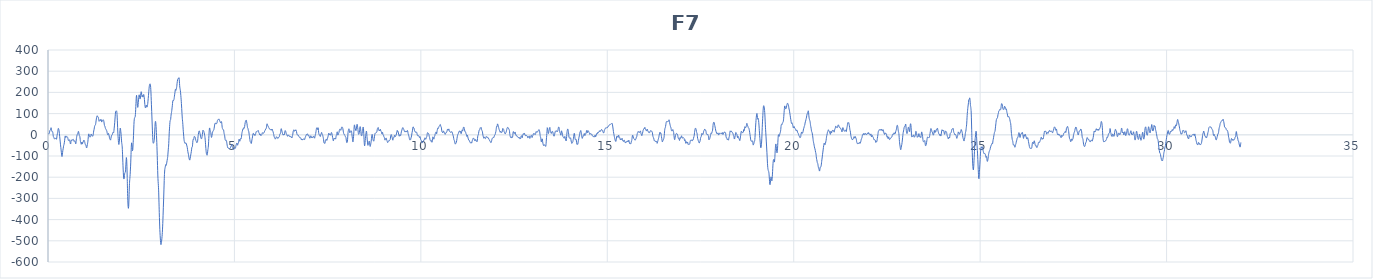
| Category | F7 |
|---|---|
| 0.0 | 8.9 |
| 0.0078125 | 4.5 |
| 0.015625 | 3.4 |
| 0.0234375 | 4.8 |
| 0.03125 | 5.8 |
| 0.0390625 | 10 |
| 0.046875 | 17.3 |
| 0.0546875 | 22 |
| 0.0625 | 23.2 |
| 0.0703125 | 26.2 |
| 0.078125 | 32.6 |
| 0.0859375 | 32.5 |
| 0.09375 | 23.6 |
| 0.1015625 | 16.7 |
| 0.109375 | 14.8 |
| 0.1171875 | 15 |
| 0.125 | 14.3 |
| 0.1328125 | 6.5 |
| 0.140625 | -5.1 |
| 0.1484375 | -10.2 |
| 0.15625 | -11.9 |
| 0.1640625 | -16.3 |
| 0.171875 | -19.3 |
| 0.1796875 | -18.6 |
| 0.1875 | -17.9 |
| 0.1953125 | -17.7 |
| 0.203125 | -16.3 |
| 0.2109375 | -15.2 |
| 0.21875 | -18.2 |
| 0.2265625 | -21.1 |
| 0.234375 | -15.4 |
| 0.2421875 | -4.1 |
| 0.25 | 3.7 |
| 0.2578125 | 10.3 |
| 0.265625 | 20.6 |
| 0.2734375 | 29.1 |
| 0.28125 | 30 |
| 0.2890625 | 25.9 |
| 0.296875 | 18.6 |
| 0.3046875 | 6.9 |
| 0.3125 | -6.8 |
| 0.3203125 | -19.9 |
| 0.328125 | -33.7 |
| 0.3359375 | -47.4 |
| 0.34375 | -59.1 |
| 0.3515625 | -71.2 |
| 0.359375 | -84.5 |
| 0.3671875 | -96.1 |
| 0.375 | -102.6 |
| 0.3828125 | -97.8 |
| 0.390625 | -84 |
| 0.3984375 | -73.3 |
| 0.40625 | -66 |
| 0.4140625 | -56.6 |
| 0.421875 | -50.1 |
| 0.4296875 | -45.3 |
| 0.4375 | -37.5 |
| 0.4453125 | -28.2 |
| 0.453125 | -15.8 |
| 0.4609375 | -5.7 |
| 0.46875 | -7.7 |
| 0.4765625 | -12.8 |
| 0.484375 | -11.9 |
| 0.4921875 | -9.1 |
| 0.5 | -7.3 |
| 0.5078125 | -8 |
| 0.515625 | -10.1 |
| 0.5234375 | -10.9 |
| 0.53125 | -14.6 |
| 0.5390625 | -22.3 |
| 0.546875 | -27.1 |
| 0.5546875 | -26 |
| 0.5625 | -23.3 |
| 0.5703125 | -23.4 |
| 0.578125 | -25.6 |
| 0.5859375 | -29.1 |
| 0.59375 | -35.8 |
| 0.6015625 | -43 |
| 0.609375 | -41.6 |
| 0.6171875 | -31 |
| 0.625 | -23.9 |
| 0.6328125 | -26.1 |
| 0.640625 | -27.3 |
| 0.6484375 | -24.3 |
| 0.65625 | -22.9 |
| 0.6640625 | -22.6 |
| 0.671875 | -21.4 |
| 0.6796875 | -21.6 |
| 0.6875 | -25.5 |
| 0.6953125 | -30.5 |
| 0.703125 | -30.8 |
| 0.7109375 | -28.4 |
| 0.71875 | -28.8 |
| 0.7265625 | -31 |
| 0.734375 | -36.5 |
| 0.7421875 | -42.8 |
| 0.75 | -38.4 |
| 0.7578125 | -24.7 |
| 0.765625 | -13.1 |
| 0.7734375 | -5.5 |
| 0.78125 | 0 |
| 0.7890625 | 2.4 |
| 0.796875 | 4.1 |
| 0.8046875 | 9.3 |
| 0.8125 | 15.5 |
| 0.8203125 | 15.4 |
| 0.828125 | 8 |
| 0.8359375 | -0.6 |
| 0.84375 | -5.3 |
| 0.8515625 | -7.3 |
| 0.859375 | -15 |
| 0.8671875 | -27.7 |
| 0.875 | -34.6 |
| 0.8828125 | -38.4 |
| 0.890625 | -44.6 |
| 0.8984375 | -42.2 |
| 0.90625 | -34.2 |
| 0.9140625 | -37.5 |
| 0.921875 | -43.7 |
| 0.9296875 | -38.3 |
| 0.9375 | -33.3 |
| 0.9453125 | -34.4 |
| 0.953125 | -30.3 |
| 0.9609375 | -24.8 |
| 0.96875 | -27 |
| 0.9765625 | -30 |
| 0.984375 | -33.1 |
| 0.9921875 | -40.7 |
| 1.0 | -46 |
| 1.0078125 | -46.6 |
| 1.015625 | -49.3 |
| 1.0234375 | -54.8 |
| 1.03125 | -60.5 |
| 1.0390625 | -61.7 |
| 1.046875 | -55.2 |
| 1.0546875 | -46.7 |
| 1.0625 | -39.7 |
| 1.0703125 | -30 |
| 1.078125 | -15.1 |
| 1.0859375 | -0.8 |
| 1.09375 | 4.4 |
| 1.1015625 | 1.3 |
| 1.109375 | -4.2 |
| 1.1171875 | -9.5 |
| 1.125 | -11.1 |
| 1.1328125 | -10.1 |
| 1.140625 | -9.7 |
| 1.1484375 | -4.2 |
| 1.15625 | 3.5 |
| 1.1640625 | 2.2 |
| 1.171875 | -2.1 |
| 1.1796875 | -2.2 |
| 1.1875 | -4 |
| 1.1953125 | -6.9 |
| 1.203125 | -6 |
| 1.2109375 | -0.4 |
| 1.21875 | 9.4 |
| 1.2265625 | 18.2 |
| 1.234375 | 24.1 |
| 1.2421875 | 32.2 |
| 1.25 | 40 |
| 1.2578125 | 43.5 |
| 1.265625 | 45.3 |
| 1.2734375 | 47.7 |
| 1.28125 | 54.4 |
| 1.2890625 | 65.4 |
| 1.296875 | 74.8 |
| 1.3046875 | 82.4 |
| 1.3125 | 88.5 |
| 1.3203125 | 89.6 |
| 1.328125 | 87 |
| 1.3359375 | 84.6 |
| 1.34375 | 84.4 |
| 1.3515625 | 81.6 |
| 1.359375 | 71.5 |
| 1.3671875 | 64.3 |
| 1.375 | 65.2 |
| 1.3828125 | 64.9 |
| 1.390625 | 66.8 |
| 1.3984375 | 71.9 |
| 1.40625 | 69.6 |
| 1.4140625 | 67.6 |
| 1.421875 | 72.2 |
| 1.4296875 | 69.6 |
| 1.4375 | 61.3 |
| 1.4453125 | 60.8 |
| 1.453125 | 65.7 |
| 1.4609375 | 68.6 |
| 1.46875 | 69.9 |
| 1.4765625 | 70.8 |
| 1.484375 | 70.7 |
| 1.4921875 | 67.9 |
| 1.5 | 61.1 |
| 1.5078125 | 50.9 |
| 1.515625 | 43.6 |
| 1.5234375 | 41.7 |
| 1.53125 | 37.2 |
| 1.5390625 | 30.4 |
| 1.546875 | 29.2 |
| 1.5546875 | 26.9 |
| 1.5625 | 21.4 |
| 1.5703125 | 20.9 |
| 1.578125 | 18 |
| 1.5859375 | 9.4 |
| 1.59375 | 4.5 |
| 1.6015625 | 0.9 |
| 1.609375 | 0.6 |
| 1.6171875 | 6.4 |
| 1.625 | 5.9 |
| 1.6328125 | -0.3 |
| 1.640625 | -5.6 |
| 1.6484375 | -14 |
| 1.65625 | -19.2 |
| 1.6640625 | -19.3 |
| 1.671875 | -23.7 |
| 1.6796875 | -24.7 |
| 1.6875 | -16.8 |
| 1.6953125 | -9.6 |
| 1.703125 | -4.9 |
| 1.7109375 | -1.3 |
| 1.71875 | -0.7 |
| 1.7265625 | 1.5 |
| 1.734375 | 7.2 |
| 1.7421875 | 11.3 |
| 1.75 | 10.3 |
| 1.7578125 | 9 |
| 1.765625 | 15.2 |
| 1.7734375 | 27.9 |
| 1.78125 | 42 |
| 1.7890625 | 57 |
| 1.796875 | 74.4 |
| 1.8046875 | 94.2 |
| 1.8125 | 108.6 |
| 1.8203125 | 111.4 |
| 1.828125 | 111.2 |
| 1.8359375 | 113.2 |
| 1.84375 | 109.7 |
| 1.8515625 | 95.6 |
| 1.859375 | 68.7 |
| 1.8671875 | 33.3 |
| 1.875 | 4.1 |
| 1.8828125 | -17.2 |
| 1.890625 | -36.2 |
| 1.8984375 | -45.5 |
| 1.90625 | -42.2 |
| 1.9140625 | -30.2 |
| 1.921875 | -7.1 |
| 1.9296875 | 19 |
| 1.9375 | 31.1 |
| 1.9453125 | 26.1 |
| 1.953125 | 14.7 |
| 1.9609375 | 0.7 |
| 1.96875 | -19.3 |
| 1.9765625 | -37.1 |
| 1.984375 | -46.3 |
| 1.9921875 | -62.6 |
| 2.0 | -94.5 |
| 2.0078125 | -129.5 |
| 2.015625 | -161.6 |
| 2.0234375 | -189.7 |
| 2.03125 | -205.9 |
| 2.0390625 | -208 |
| 2.046875 | -199 |
| 2.0546875 | -185.6 |
| 2.0625 | -178.5 |
| 2.0703125 | -177.5 |
| 2.078125 | -170.5 |
| 2.0859375 | -151.7 |
| 2.09375 | -125.5 |
| 2.1015625 | -107.3 |
| 2.109375 | -115.5 |
| 2.1171875 | -150.2 |
| 2.125 | -201.7 |
| 2.1328125 | -261.9 |
| 2.140625 | -311.4 |
| 2.1484375 | -337.4 |
| 2.15625 | -346.9 |
| 2.1640625 | -337.6 |
| 2.171875 | -302.1 |
| 2.1796875 | -256 |
| 2.1875 | -223.4 |
| 2.1953125 | -206 |
| 2.203125 | -187.1 |
| 2.2109375 | -161.4 |
| 2.21875 | -132.6 |
| 2.2265625 | -93.5 |
| 2.234375 | -53.4 |
| 2.2421875 | -37.8 |
| 2.25 | -45.3 |
| 2.2578125 | -61.3 |
| 2.265625 | -75.3 |
| 2.2734375 | -70.3 |
| 2.28125 | -47.5 |
| 2.2890625 | -20.6 |
| 2.296875 | 13.3 |
| 2.3046875 | 48.7 |
| 2.3125 | 70.4 |
| 2.3203125 | 79.4 |
| 2.328125 | 81.6 |
| 2.3359375 | 83.4 |
| 2.34375 | 95.3 |
| 2.3515625 | 118.5 |
| 2.359375 | 148.3 |
| 2.3671875 | 176.6 |
| 2.375 | 186.1 |
| 2.3828125 | 173.8 |
| 2.390625 | 155.2 |
| 2.3984375 | 138.9 |
| 2.40625 | 129.3 |
| 2.4140625 | 135.4 |
| 2.421875 | 151.9 |
| 2.4296875 | 168.2 |
| 2.4375 | 182.7 |
| 2.4453125 | 188.7 |
| 2.453125 | 183.4 |
| 2.4609375 | 175.1 |
| 2.46875 | 168.9 |
| 2.4765625 | 171.8 |
| 2.484375 | 186.5 |
| 2.4921875 | 199.3 |
| 2.5 | 203.3 |
| 2.5078125 | 198.5 |
| 2.515625 | 185.5 |
| 2.5234375 | 179.6 |
| 2.53125 | 185.3 |
| 2.5390625 | 184.6 |
| 2.546875 | 177.9 |
| 2.5546875 | 181 |
| 2.5625 | 189.4 |
| 2.5703125 | 189.3 |
| 2.578125 | 180.6 |
| 2.5859375 | 166.9 |
| 2.59375 | 150.1 |
| 2.6015625 | 136.3 |
| 2.609375 | 129 |
| 2.6171875 | 126.6 |
| 2.625 | 131.1 |
| 2.6328125 | 139.1 |
| 2.640625 | 139.7 |
| 2.6484375 | 133.6 |
| 2.65625 | 130.6 |
| 2.6640625 | 133.6 |
| 2.671875 | 142.4 |
| 2.6796875 | 155.8 |
| 2.6875 | 170.6 |
| 2.6953125 | 185.9 |
| 2.703125 | 203 |
| 2.7109375 | 219.8 |
| 2.71875 | 231.5 |
| 2.7265625 | 237.8 |
| 2.734375 | 240.5 |
| 2.7421875 | 238.4 |
| 2.75 | 230.6 |
| 2.7578125 | 212.3 |
| 2.765625 | 180.3 |
| 2.7734375 | 144.3 |
| 2.78125 | 110.6 |
| 2.7890625 | 74.5 |
| 2.796875 | 36.9 |
| 2.8046875 | 1.6 |
| 2.8125 | -26 |
| 2.8203125 | -38.7 |
| 2.828125 | -39.5 |
| 2.8359375 | -36.9 |
| 2.84375 | -31.8 |
| 2.8515625 | -20.3 |
| 2.859375 | 2.5 |
| 2.8671875 | 33.1 |
| 2.875 | 56.2 |
| 2.8828125 | 63.6 |
| 2.890625 | 57.7 |
| 2.8984375 | 39.4 |
| 2.90625 | 11.5 |
| 2.9140625 | -20 |
| 2.921875 | -55.2 |
| 2.9296875 | -97.9 |
| 2.9375 | -145.7 |
| 2.9453125 | -189.5 |
| 2.953125 | -219.6 |
| 2.9609375 | -239.8 |
| 2.96875 | -270.4 |
| 2.9765625 | -317.7 |
| 2.984375 | -367.1 |
| 2.9921875 | -411.1 |
| 3.0 | -447.5 |
| 3.0078125 | -474.8 |
| 3.015625 | -497.8 |
| 3.0234375 | -514.3 |
| 3.03125 | -518.1 |
| 3.0390625 | -512.4 |
| 3.046875 | -501.6 |
| 3.0546875 | -487.8 |
| 3.0625 | -471.3 |
| 3.0703125 | -448.6 |
| 3.078125 | -418.6 |
| 3.0859375 | -381.9 |
| 3.09375 | -341.7 |
| 3.1015625 | -302.3 |
| 3.109375 | -260 |
| 3.1171875 | -215.3 |
| 3.125 | -180.7 |
| 3.1328125 | -162.8 |
| 3.140625 | -155.4 |
| 3.1484375 | -147.8 |
| 3.15625 | -140.9 |
| 3.1640625 | -142.5 |
| 3.171875 | -144 |
| 3.1796875 | -137.1 |
| 3.1875 | -128.7 |
| 3.1953125 | -120.6 |
| 3.203125 | -112.4 |
| 3.2109375 | -103 |
| 3.21875 | -85.8 |
| 3.2265625 | -67.7 |
| 3.234375 | -53.2 |
| 3.2421875 | -27.8 |
| 3.25 | 4.2 |
| 3.2578125 | 27.8 |
| 3.265625 | 48.4 |
| 3.2734375 | 64.8 |
| 3.28125 | 68.3 |
| 3.2890625 | 72.2 |
| 3.296875 | 86.4 |
| 3.3046875 | 98.4 |
| 3.3125 | 105.1 |
| 3.3203125 | 115.5 |
| 3.328125 | 127.1 |
| 3.3359375 | 139.5 |
| 3.34375 | 154.7 |
| 3.3515625 | 161.7 |
| 3.359375 | 160 |
| 3.3671875 | 161.8 |
| 3.375 | 165.3 |
| 3.3828125 | 170.9 |
| 3.390625 | 182.2 |
| 3.3984375 | 191.5 |
| 3.40625 | 201.1 |
| 3.4140625 | 212.8 |
| 3.421875 | 213.8 |
| 3.4296875 | 209.5 |
| 3.4375 | 213.2 |
| 3.4453125 | 219.6 |
| 3.453125 | 228 |
| 3.4609375 | 240.8 |
| 3.46875 | 252 |
| 3.4765625 | 259.9 |
| 3.484375 | 264.8 |
| 3.4921875 | 265.1 |
| 3.5 | 265.2 |
| 3.5078125 | 268.7 |
| 3.515625 | 268 |
| 3.5234375 | 253.3 |
| 3.53125 | 231.8 |
| 3.5390625 | 219.9 |
| 3.546875 | 213.4 |
| 3.5546875 | 200.7 |
| 3.5625 | 184.8 |
| 3.5703125 | 168 |
| 3.578125 | 147.2 |
| 3.5859375 | 124.2 |
| 3.59375 | 100 |
| 3.6015625 | 78.3 |
| 3.609375 | 64 |
| 3.6171875 | 48.1 |
| 3.625 | 26.3 |
| 3.6328125 | 8.4 |
| 3.640625 | -7 |
| 3.6484375 | -23 |
| 3.65625 | -31.1 |
| 3.6640625 | -34.1 |
| 3.671875 | -39.1 |
| 3.6796875 | -41.3 |
| 3.6875 | -39.6 |
| 3.6953125 | -38.3 |
| 3.703125 | -38.3 |
| 3.7109375 | -42.2 |
| 3.71875 | -48.4 |
| 3.7265625 | -53.1 |
| 3.734375 | -59.4 |
| 3.7421875 | -68.6 |
| 3.75 | -78.2 |
| 3.7578125 | -86 |
| 3.765625 | -91.7 |
| 3.7734375 | -99.3 |
| 3.78125 | -108.7 |
| 3.7890625 | -115 |
| 3.796875 | -118.7 |
| 3.8046875 | -118.9 |
| 3.8125 | -112.5 |
| 3.8203125 | -103.5 |
| 3.828125 | -95.1 |
| 3.8359375 | -87.3 |
| 3.84375 | -79.2 |
| 3.8515625 | -67.8 |
| 3.859375 | -58.7 |
| 3.8671875 | -57.7 |
| 3.875 | -52.4 |
| 3.8828125 | -34.9 |
| 3.890625 | -22.8 |
| 3.8984375 | -23.6 |
| 3.90625 | -22.1 |
| 3.9140625 | -13.8 |
| 3.921875 | -8.1 |
| 3.9296875 | -7.5 |
| 3.9375 | -9.2 |
| 3.9453125 | -11.4 |
| 3.953125 | -16.3 |
| 3.9609375 | -24.1 |
| 3.96875 | -28.3 |
| 3.9765625 | -30.6 |
| 3.984375 | -35.7 |
| 3.9921875 | -37.2 |
| 4.0 | -35.6 |
| 4.0078125 | -34.5 |
| 4.015625 | -25 |
| 4.0234375 | -9.8 |
| 4.03125 | 1.1 |
| 4.0390625 | 9.6 |
| 4.046875 | 16.2 |
| 4.0546875 | 18.6 |
| 4.0625 | 16.8 |
| 4.0703125 | 10.8 |
| 4.078125 | 4.9 |
| 4.0859375 | -1.1 |
| 4.09375 | -9.7 |
| 4.1015625 | -15.6 |
| 4.109375 | -17.9 |
| 4.1171875 | -19.1 |
| 4.125 | -15.2 |
| 4.1328125 | -7.4 |
| 4.140625 | 2.7 |
| 4.1484375 | 15 |
| 4.15625 | 21.7 |
| 4.1640625 | 20.2 |
| 4.171875 | 18 |
| 4.1796875 | 15.7 |
| 4.1875 | 10.4 |
| 4.1953125 | 3.4 |
| 4.203125 | -3.8 |
| 4.2109375 | -13.4 |
| 4.21875 | -28.3 |
| 4.2265625 | -46.8 |
| 4.234375 | -64.6 |
| 4.2421875 | -79.9 |
| 4.25 | -89.8 |
| 4.2578125 | -94 |
| 4.265625 | -96.4 |
| 4.2734375 | -92.8 |
| 4.28125 | -80.4 |
| 4.2890625 | -69.4 |
| 4.296875 | -60.5 |
| 4.3046875 | -43.2 |
| 4.3125 | -17.5 |
| 4.3203125 | 8.5 |
| 4.328125 | 27.2 |
| 4.3359375 | 32.4 |
| 4.34375 | 25.6 |
| 4.3515625 | 17.8 |
| 4.359375 | 15.1 |
| 4.3671875 | 9.6 |
| 4.375 | -3.1 |
| 4.3828125 | -12.1 |
| 4.390625 | -10.4 |
| 4.3984375 | -3 |
| 4.40625 | 5.3 |
| 4.4140625 | 11.7 |
| 4.421875 | 16.4 |
| 4.4296875 | 19.7 |
| 4.4375 | 20.7 |
| 4.4453125 | 22.4 |
| 4.453125 | 28.3 |
| 4.4609375 | 37 |
| 4.46875 | 45.8 |
| 4.4765625 | 52 |
| 4.484375 | 55.3 |
| 4.4921875 | 55.8 |
| 4.5 | 52.7 |
| 4.5078125 | 50.9 |
| 4.515625 | 52.8 |
| 4.5234375 | 53.2 |
| 4.53125 | 55.2 |
| 4.5390625 | 62.8 |
| 4.546875 | 68.3 |
| 4.5546875 | 69.7 |
| 4.5625 | 72.5 |
| 4.5703125 | 73.8 |
| 4.578125 | 71.9 |
| 4.5859375 | 72.2 |
| 4.59375 | 72.8 |
| 4.6015625 | 68.3 |
| 4.609375 | 63.4 |
| 4.6171875 | 60.9 |
| 4.625 | 57.7 |
| 4.6328125 | 56.7 |
| 4.640625 | 60.2 |
| 4.6484375 | 62.8 |
| 4.65625 | 59.7 |
| 4.6640625 | 48.7 |
| 4.671875 | 34.9 |
| 4.6796875 | 29.2 |
| 4.6875 | 28 |
| 4.6953125 | 23.9 |
| 4.703125 | 23.2 |
| 4.7109375 | 21.8 |
| 4.71875 | 11.1 |
| 4.7265625 | 2.9 |
| 4.734375 | -0.2 |
| 4.7421875 | -10.1 |
| 4.75 | -21.4 |
| 4.7578125 | -25.9 |
| 4.765625 | -26.9 |
| 4.7734375 | -26.1 |
| 4.78125 | -25.6 |
| 4.7890625 | -30.4 |
| 4.796875 | -39.6 |
| 4.8046875 | -48.7 |
| 4.8125 | -55.6 |
| 4.8203125 | -60.6 |
| 4.828125 | -62.4 |
| 4.8359375 | -61.6 |
| 4.84375 | -63.2 |
| 4.8515625 | -66.2 |
| 4.859375 | -67.1 |
| 4.8671875 | -66.3 |
| 4.875 | -64.5 |
| 4.8828125 | -63.8 |
| 4.890625 | -63.1 |
| 4.8984375 | -57.8 |
| 4.90625 | -53.8 |
| 4.9140625 | -53.3 |
| 4.921875 | -47.8 |
| 4.9296875 | -45 |
| 4.9375 | -52.1 |
| 4.9453125 | -57.8 |
| 4.953125 | -59.9 |
| 4.9609375 | -64.2 |
| 4.96875 | -67.3 |
| 4.9765625 | -68.4 |
| 4.984375 | -69 |
| 4.9921875 | -66.1 |
| 5.0 | -61.9 |
| 5.0078125 | -60.4 |
| 5.015625 | -61.9 |
| 5.0234375 | -63.8 |
| 5.03125 | -60.5 |
| 5.0390625 | -52.5 |
| 5.046875 | -46.7 |
| 5.0546875 | -42.9 |
| 5.0625 | -39.1 |
| 5.0703125 | -40.1 |
| 5.078125 | -46.7 |
| 5.0859375 | -49.1 |
| 5.09375 | -42.9 |
| 5.1015625 | -38.6 |
| 5.109375 | -37.8 |
| 5.1171875 | -29.8 |
| 5.125 | -20.7 |
| 5.1328125 | -23.2 |
| 5.140625 | -29.6 |
| 5.1484375 | -29.3 |
| 5.15625 | -23.4 |
| 5.1640625 | -18.2 |
| 5.171875 | -18.7 |
| 5.1796875 | -19.3 |
| 5.1875 | -12.3 |
| 5.1953125 | 0.2 |
| 5.203125 | 10.1 |
| 5.2109375 | 15.5 |
| 5.21875 | 22.1 |
| 5.2265625 | 27.9 |
| 5.234375 | 26.5 |
| 5.2421875 | 27.3 |
| 5.25 | 33.3 |
| 5.2578125 | 32.6 |
| 5.265625 | 31.4 |
| 5.2734375 | 38.8 |
| 5.28125 | 48.7 |
| 5.2890625 | 57.7 |
| 5.296875 | 63.6 |
| 5.3046875 | 66.2 |
| 5.3125 | 69.5 |
| 5.3203125 | 67.8 |
| 5.328125 | 60.2 |
| 5.3359375 | 53.2 |
| 5.34375 | 43 |
| 5.3515625 | 34 |
| 5.359375 | 32.1 |
| 5.3671875 | 26.6 |
| 5.375 | 19.3 |
| 5.3828125 | 16.7 |
| 5.390625 | 8.5 |
| 5.3984375 | -3.1 |
| 5.40625 | -11 |
| 5.4140625 | -22 |
| 5.421875 | -32 |
| 5.4296875 | -33.5 |
| 5.4375 | -34.8 |
| 5.4453125 | -39.7 |
| 5.453125 | -40.9 |
| 5.4609375 | -34 |
| 5.46875 | -24.2 |
| 5.4765625 | -17.8 |
| 5.484375 | -9.9 |
| 5.4921875 | 0.1 |
| 5.5 | 5.5 |
| 5.5078125 | 7.3 |
| 5.515625 | 4.7 |
| 5.5234375 | -1.3 |
| 5.53125 | -0.9 |
| 5.5390625 | 0.9 |
| 5.546875 | -3.1 |
| 5.5546875 | -3.1 |
| 5.5625 | 1.7 |
| 5.5703125 | 6.1 |
| 5.578125 | 11.7 |
| 5.5859375 | 15.3 |
| 5.59375 | 15.1 |
| 5.6015625 | 15.2 |
| 5.609375 | 16.4 |
| 5.6171875 | 17.4 |
| 5.625 | 17.6 |
| 5.6328125 | 19.1 |
| 5.640625 | 19.9 |
| 5.6484375 | 14.7 |
| 5.65625 | 9.2 |
| 5.6640625 | 7.4 |
| 5.671875 | 2.6 |
| 5.6796875 | -0.8 |
| 5.6875 | 2.9 |
| 5.6953125 | 3.8 |
| 5.703125 | -1.7 |
| 5.7109375 | -4.3 |
| 5.71875 | -1.8 |
| 5.7265625 | -0.3 |
| 5.734375 | 1.1 |
| 5.7421875 | 6.5 |
| 5.75 | 10.2 |
| 5.7578125 | 7.9 |
| 5.765625 | 6.2 |
| 5.7734375 | 7.4 |
| 5.78125 | 8.6 |
| 5.7890625 | 9.2 |
| 5.796875 | 10.2 |
| 5.8046875 | 14.3 |
| 5.8125 | 18.7 |
| 5.8203125 | 19.7 |
| 5.828125 | 22.1 |
| 5.8359375 | 26.8 |
| 5.84375 | 28.7 |
| 5.8515625 | 29.6 |
| 5.859375 | 35.3 |
| 5.8671875 | 45.7 |
| 5.875 | 51.9 |
| 5.8828125 | 48.6 |
| 5.890625 | 44.4 |
| 5.8984375 | 43.4 |
| 5.90625 | 39.6 |
| 5.9140625 | 35.7 |
| 5.921875 | 34.5 |
| 5.9296875 | 31.4 |
| 5.9375 | 27.9 |
| 5.9453125 | 26.7 |
| 5.953125 | 25.9 |
| 5.9609375 | 24.9 |
| 5.96875 | 23.4 |
| 5.9765625 | 24.4 |
| 5.984375 | 27.4 |
| 5.9921875 | 24.8 |
| 6.0 | 21.4 |
| 6.0078125 | 25.4 |
| 6.015625 | 26.3 |
| 6.0234375 | 20.4 |
| 6.03125 | 16.8 |
| 6.0390625 | 12.8 |
| 6.046875 | 6.4 |
| 6.0546875 | 1.1 |
| 6.0625 | -6.3 |
| 6.0703125 | -12.4 |
| 6.078125 | -13.1 |
| 6.0859375 | -16.1 |
| 6.09375 | -20.3 |
| 6.1015625 | -19.5 |
| 6.109375 | -17 |
| 6.1171875 | -13.2 |
| 6.125 | -9.1 |
| 6.1328125 | -10.5 |
| 6.140625 | -12.8 |
| 6.1484375 | -12.4 |
| 6.15625 | -14.7 |
| 6.1640625 | -17.5 |
| 6.171875 | -15.7 |
| 6.1796875 | -13 |
| 6.1875 | -12.5 |
| 6.1953125 | -11.8 |
| 6.203125 | -9.1 |
| 6.2109375 | -2.8 |
| 6.21875 | 4.1 |
| 6.2265625 | 5.5 |
| 6.234375 | 6.4 |
| 6.2421875 | 16 |
| 6.25 | 26.9 |
| 6.2578125 | 28.7 |
| 6.265625 | 23.5 |
| 6.2734375 | 17.3 |
| 6.28125 | 12 |
| 6.2890625 | 6.6 |
| 6.296875 | 1.1 |
| 6.3046875 | -1.7 |
| 6.3125 | -1 |
| 6.3203125 | 1.6 |
| 6.328125 | 1.9 |
| 6.3359375 | -0.9 |
| 6.34375 | 2.6 |
| 6.3515625 | 13.4 |
| 6.359375 | 19.6 |
| 6.3671875 | 19.1 |
| 6.375 | 16.3 |
| 6.3828125 | 11.2 |
| 6.390625 | 6.2 |
| 6.3984375 | 3.3 |
| 6.40625 | 0.2 |
| 6.4140625 | -3.6 |
| 6.421875 | -6.8 |
| 6.4296875 | -6.5 |
| 6.4375 | -3 |
| 6.4453125 | -0.8 |
| 6.453125 | -1 |
| 6.4609375 | -3.2 |
| 6.46875 | -7.1 |
| 6.4765625 | -7.4 |
| 6.484375 | -6.6 |
| 6.4921875 | -9.6 |
| 6.5 | -9.8 |
| 6.5078125 | -8.1 |
| 6.515625 | -10.5 |
| 6.5234375 | -10.8 |
| 6.53125 | -11.2 |
| 6.5390625 | -15.1 |
| 6.546875 | -12 |
| 6.5546875 | -5.3 |
| 6.5625 | -1.3 |
| 6.5703125 | 8.7 |
| 6.578125 | 18.2 |
| 6.5859375 | 20.3 |
| 6.59375 | 23.4 |
| 6.6015625 | 22.4 |
| 6.609375 | 16.8 |
| 6.6171875 | 18.3 |
| 6.625 | 20.1 |
| 6.6328125 | 18.4 |
| 6.640625 | 21.8 |
| 6.6484375 | 23.9 |
| 6.65625 | 20.6 |
| 6.6640625 | 16 |
| 6.671875 | 8.1 |
| 6.6796875 | 1.7 |
| 6.6875 | 0.6 |
| 6.6953125 | -1.3 |
| 6.703125 | -2 |
| 6.7109375 | -0.9 |
| 6.71875 | -4.1 |
| 6.7265625 | -7.3 |
| 6.734375 | -8.4 |
| 6.7421875 | -11.7 |
| 6.75 | -13 |
| 6.7578125 | -11.8 |
| 6.765625 | -12.9 |
| 6.7734375 | -13.9 |
| 6.78125 | -16 |
| 6.7890625 | -21.6 |
| 6.796875 | -23.2 |
| 6.8046875 | -20 |
| 6.8125 | -20.7 |
| 6.8203125 | -24.4 |
| 6.828125 | -24.4 |
| 6.8359375 | -21.1 |
| 6.84375 | -19.7 |
| 6.8515625 | -20.6 |
| 6.859375 | -19.7 |
| 6.8671875 | -18.8 |
| 6.875 | -21.8 |
| 6.8828125 | -22.7 |
| 6.890625 | -18.1 |
| 6.8984375 | -13 |
| 6.90625 | -9.4 |
| 6.9140625 | -6.1 |
| 6.921875 | -2.2 |
| 6.9296875 | 1.2 |
| 6.9375 | 0.6 |
| 6.9453125 | 0 |
| 6.953125 | 3.5 |
| 6.9609375 | 4.6 |
| 6.96875 | 0.7 |
| 6.9765625 | -3.7 |
| 6.984375 | -5.5 |
| 6.9921875 | -3.6 |
| 7.0 | -3.6 |
| 7.0078125 | -9 |
| 7.015625 | -13.9 |
| 7.0234375 | -15.8 |
| 7.03125 | -14.9 |
| 7.0390625 | -9.9 |
| 7.046875 | -4.9 |
| 7.0546875 | -5.5 |
| 7.0625 | -11.5 |
| 7.0703125 | -14 |
| 7.078125 | -9.8 |
| 7.0859375 | -9.8 |
| 7.09375 | -13.2 |
| 7.1015625 | -11.7 |
| 7.109375 | -10.6 |
| 7.1171875 | -10.8 |
| 7.125 | -7.6 |
| 7.1328125 | -7.6 |
| 7.140625 | -13.1 |
| 7.1484375 | -16.1 |
| 7.15625 | -12.5 |
| 7.1640625 | -4.9 |
| 7.171875 | 1.2 |
| 7.1796875 | 6.2 |
| 7.1875 | 14.7 |
| 7.1953125 | 25 |
| 7.203125 | 31.5 |
| 7.2109375 | 33.1 |
| 7.21875 | 30.3 |
| 7.2265625 | 25.2 |
| 7.234375 | 26.9 |
| 7.2421875 | 33.5 |
| 7.25 | 27.7 |
| 7.2578125 | 12.2 |
| 7.265625 | 4.1 |
| 7.2734375 | 0.8 |
| 7.28125 | -2 |
| 7.2890625 | -2.5 |
| 7.296875 | -6.2 |
| 7.3046875 | -7.8 |
| 7.3125 | -1.8 |
| 7.3203125 | 2.6 |
| 7.328125 | 6.2 |
| 7.3359375 | 11.3 |
| 7.34375 | 9.1 |
| 7.3515625 | 3.3 |
| 7.359375 | 1.3 |
| 7.3671875 | -2.2 |
| 7.375 | -8.1 |
| 7.3828125 | -13.7 |
| 7.390625 | -23.4 |
| 7.3984375 | -35.2 |
| 7.40625 | -39.3 |
| 7.4140625 | -38.4 |
| 7.421875 | -40.6 |
| 7.4296875 | -38.3 |
| 7.4375 | -28.6 |
| 7.4453125 | -24.7 |
| 7.453125 | -24.4 |
| 7.4609375 | -20.7 |
| 7.46875 | -22.3 |
| 7.4765625 | -26.6 |
| 7.484375 | -23.8 |
| 7.4921875 | -18.6 |
| 7.5 | -14.3 |
| 7.5078125 | -9.7 |
| 7.515625 | -4.1 |
| 7.5234375 | 3.9 |
| 7.53125 | 8.1 |
| 7.5390625 | 3.8 |
| 7.546875 | 0 |
| 7.5546875 | 2.1 |
| 7.5625 | 3.3 |
| 7.5703125 | 0 |
| 7.578125 | -2 |
| 7.5859375 | 1.8 |
| 7.59375 | 8 |
| 7.6015625 | 11.1 |
| 7.609375 | 9.3 |
| 7.6171875 | 3.3 |
| 7.625 | -4.6 |
| 7.6328125 | -11.9 |
| 7.640625 | -18.9 |
| 7.6484375 | -26.6 |
| 7.65625 | -28.2 |
| 7.6640625 | -21 |
| 7.671875 | -17 |
| 7.6796875 | -19 |
| 7.6875 | -17.7 |
| 7.6953125 | -15.2 |
| 7.703125 | -17.6 |
| 7.7109375 | -20.5 |
| 7.71875 | -16.4 |
| 7.7265625 | -7 |
| 7.734375 | -2.1 |
| 7.7421875 | 0.8 |
| 7.75 | 10.1 |
| 7.7578125 | 14.1 |
| 7.765625 | 5.5 |
| 7.7734375 | -1.4 |
| 7.78125 | 0.1 |
| 7.7890625 | 4.1 |
| 7.796875 | 7.4 |
| 7.8046875 | 12 |
| 7.8125 | 20.1 |
| 7.8203125 | 25.6 |
| 7.828125 | 25.3 |
| 7.8359375 | 25.2 |
| 7.84375 | 24.3 |
| 7.8515625 | 21.2 |
| 7.859375 | 23.9 |
| 7.8671875 | 31.9 |
| 7.875 | 36.2 |
| 7.8828125 | 36.4 |
| 7.890625 | 36.3 |
| 7.8984375 | 35.1 |
| 7.90625 | 30.3 |
| 7.9140625 | 22.5 |
| 7.921875 | 13.6 |
| 7.9296875 | 6.7 |
| 7.9375 | 3.7 |
| 7.9453125 | 1.5 |
| 7.953125 | -1.2 |
| 7.9609375 | -2.5 |
| 7.96875 | -4.9 |
| 7.9765625 | -8.7 |
| 7.984375 | -10.7 |
| 7.9921875 | -14.4 |
| 8.0 | -24.8 |
| 8.0078125 | -34.6 |
| 8.015625 | -37 |
| 8.0234375 | -35.9 |
| 8.03125 | -29.7 |
| 8.0390625 | -10.6 |
| 8.046875 | 10.6 |
| 8.0546875 | 19.3 |
| 8.0625 | 23.6 |
| 8.0703125 | 28.4 |
| 8.078125 | 24 |
| 8.0859375 | 14 |
| 8.09375 | 9.5 |
| 8.1015625 | 10.9 |
| 8.109375 | 15.8 |
| 8.1171875 | 18.8 |
| 8.125 | 17.6 |
| 8.1328125 | 18.2 |
| 8.140625 | 16.7 |
| 8.1484375 | 5.6 |
| 8.15625 | -6.5 |
| 8.1640625 | -16.3 |
| 8.171875 | -28.6 |
| 8.1796875 | -33.5 |
| 8.1875 | -23.8 |
| 8.1953125 | -7.2 |
| 8.203125 | 14.1 |
| 8.2109375 | 36.7 |
| 8.21875 | 46.8 |
| 8.2265625 | 41.6 |
| 8.234375 | 33.8 |
| 8.2421875 | 28.5 |
| 8.25 | 22.5 |
| 8.2578125 | 19.2 |
| 8.265625 | 23.1 |
| 8.2734375 | 31.4 |
| 8.28125 | 42.2 |
| 8.2890625 | 49.6 |
| 8.296875 | 45.4 |
| 8.3046875 | 35.2 |
| 8.3125 | 24.9 |
| 8.3203125 | 11.7 |
| 8.328125 | 2.7 |
| 8.3359375 | 2.7 |
| 8.34375 | 4.7 |
| 8.3515625 | 11.6 |
| 8.359375 | 26.2 |
| 8.3671875 | 36.9 |
| 8.375 | 37.9 |
| 8.3828125 | 30.5 |
| 8.390625 | 15.3 |
| 8.3984375 | 1.4 |
| 8.40625 | -4 |
| 8.4140625 | -4.9 |
| 8.421875 | 0.8 |
| 8.4296875 | 14.7 |
| 8.4375 | 25.7 |
| 8.4453125 | 31.7 |
| 8.453125 | 36.8 |
| 8.4609375 | 30.5 |
| 8.46875 | 7.3 |
| 8.4765625 | -22.1 |
| 8.484375 | -44.9 |
| 8.4921875 | -51.8 |
| 8.5 | -43.6 |
| 8.5078125 | -27.4 |
| 8.515625 | -9.4 |
| 8.5234375 | 2.6 |
| 8.53125 | 10.6 |
| 8.5390625 | 17.6 |
| 8.546875 | 11.1 |
| 8.5546875 | -8 |
| 8.5625 | -24.1 |
| 8.5703125 | -38.2 |
| 8.578125 | -49.2 |
| 8.5859375 | -47.6 |
| 8.59375 | -40.4 |
| 8.6015625 | -36.6 |
| 8.609375 | -32.1 |
| 8.6171875 | -29.9 |
| 8.625 | -37.4 |
| 8.6328125 | -49.3 |
| 8.640625 | -55 |
| 8.6484375 | -51 |
| 8.65625 | -43.1 |
| 8.6640625 | -35.4 |
| 8.671875 | -24.1 |
| 8.6796875 | -10.2 |
| 8.6875 | -0.8 |
| 8.6953125 | 1.9 |
| 8.703125 | -4.1 |
| 8.7109375 | -16.4 |
| 8.71875 | -24.4 |
| 8.7265625 | -27.4 |
| 8.734375 | -30.2 |
| 8.7421875 | -27.4 |
| 8.75 | -17.5 |
| 8.7578125 | -6.7 |
| 8.765625 | 2 |
| 8.7734375 | 7.2 |
| 8.78125 | 8.2 |
| 8.7890625 | 7.9 |
| 8.796875 | 9.2 |
| 8.8046875 | 11 |
| 8.8125 | 11.5 |
| 8.8203125 | 14.4 |
| 8.828125 | 22.2 |
| 8.8359375 | 29.5 |
| 8.84375 | 32.5 |
| 8.8515625 | 34.2 |
| 8.859375 | 33.5 |
| 8.8671875 | 26.3 |
| 8.875 | 20.4 |
| 8.8828125 | 21.6 |
| 8.890625 | 20.8 |
| 8.8984375 | 18 |
| 8.90625 | 22.6 |
| 8.9140625 | 26.4 |
| 8.921875 | 21.3 |
| 8.9296875 | 16.9 |
| 8.9375 | 15.5 |
| 8.9453125 | 10.1 |
| 8.953125 | 4.6 |
| 8.9609375 | 6.9 |
| 8.96875 | 12.2 |
| 8.9765625 | 8.9 |
| 8.984375 | 0.4 |
| 8.9921875 | -1.6 |
| 9.0 | -2.3 |
| 9.0078125 | -8.8 |
| 9.015625 | -12 |
| 9.0234375 | -13.2 |
| 9.03125 | -21.3 |
| 9.0390625 | -25.2 |
| 9.046875 | -20.1 |
| 9.0546875 | -17.7 |
| 9.0625 | -16.4 |
| 9.0703125 | -14.9 |
| 9.078125 | -20.4 |
| 9.0859375 | -25.9 |
| 9.09375 | -27.9 |
| 9.1015625 | -33.6 |
| 9.109375 | -36.9 |
| 9.1171875 | -34.3 |
| 9.125 | -32.4 |
| 9.1328125 | -30 |
| 9.140625 | -27.1 |
| 9.1484375 | -27.7 |
| 9.15625 | -27.8 |
| 9.1640625 | -25.5 |
| 9.171875 | -24.2 |
| 9.1796875 | -20.1 |
| 9.1875 | -10.4 |
| 9.1953125 | -2 |
| 9.203125 | 1 |
| 9.2109375 | -0.1 |
| 9.21875 | -5.5 |
| 9.2265625 | -11 |
| 9.234375 | -15.7 |
| 9.2421875 | -23.2 |
| 9.25 | -25.2 |
| 9.2578125 | -18 |
| 9.265625 | -13.8 |
| 9.2734375 | -14.2 |
| 9.28125 | -10.8 |
| 9.2890625 | -4.2 |
| 9.296875 | -1.8 |
| 9.3046875 | -6.9 |
| 9.3125 | -9.6 |
| 9.3203125 | -6 |
| 9.328125 | -4.4 |
| 9.3359375 | -1.6 |
| 9.34375 | 4.2 |
| 9.3515625 | 8.5 |
| 9.359375 | 16.2 |
| 9.3671875 | 21.1 |
| 9.375 | 15.9 |
| 9.3828125 | 14.3 |
| 9.390625 | 15.6 |
| 9.3984375 | 8.5 |
| 9.40625 | 0.4 |
| 9.4140625 | -4.2 |
| 9.421875 | -6.7 |
| 9.4296875 | -3.4 |
| 9.4375 | 0.8 |
| 9.4453125 | -0.9 |
| 9.453125 | -4.2 |
| 9.4609375 | -2.1 |
| 9.46875 | 6 |
| 9.4765625 | 13.9 |
| 9.484375 | 18.3 |
| 9.4921875 | 22.9 |
| 9.5 | 28.4 |
| 9.5078125 | 32.2 |
| 9.515625 | 34 |
| 9.5234375 | 32.4 |
| 9.53125 | 28.8 |
| 9.5390625 | 26.3 |
| 9.546875 | 23.3 |
| 9.5546875 | 18.5 |
| 9.5625 | 15 |
| 9.5703125 | 15.5 |
| 9.578125 | 17.4 |
| 9.5859375 | 16.7 |
| 9.59375 | 14 |
| 9.6015625 | 13.9 |
| 9.609375 | 16.8 |
| 9.6171875 | 17.1 |
| 9.625 | 14.3 |
| 9.6328125 | 16.3 |
| 9.640625 | 20.6 |
| 9.6484375 | 16.4 |
| 9.65625 | 7.6 |
| 9.6640625 | 2.5 |
| 9.671875 | -1.7 |
| 9.6796875 | -6.9 |
| 9.6875 | -13.2 |
| 9.6953125 | -20.9 |
| 9.703125 | -23.9 |
| 9.7109375 | -23.7 |
| 9.71875 | -24.7 |
| 9.7265625 | -21.6 |
| 9.734375 | -15.4 |
| 9.7421875 | -11.2 |
| 9.75 | -5.4 |
| 9.7578125 | 3.5 |
| 9.765625 | 11.6 |
| 9.7734375 | 18.7 |
| 9.78125 | 27.7 |
| 9.7890625 | 36.5 |
| 9.796875 | 37.1 |
| 9.8046875 | 32 |
| 9.8125 | 31.8 |
| 9.8203125 | 30.3 |
| 9.828125 | 21.6 |
| 9.8359375 | 17 |
| 9.84375 | 17.5 |
| 9.8515625 | 13.9 |
| 9.859375 | 11.1 |
| 9.8671875 | 12.6 |
| 9.875 | 12.6 |
| 9.8828125 | 12.2 |
| 9.890625 | 10.8 |
| 9.8984375 | 4.1 |
| 9.90625 | -2.5 |
| 9.9140625 | -4.2 |
| 9.921875 | -4.8 |
| 9.9296875 | -4.5 |
| 9.9375 | -3.5 |
| 9.9453125 | -4.7 |
| 9.953125 | -8.6 |
| 9.9609375 | -12.8 |
| 9.96875 | -11.9 |
| 9.9765625 | -8.5 |
| 9.984375 | -12.1 |
| 9.9921875 | -20.2 |
| 10.0 | -24.5 |
| 10.0078125 | -26 |
| 10.015625 | -27.6 |
| 10.0234375 | -31 |
| 10.03125 | -36.2 |
| 10.0390625 | -38.1 |
| 10.046875 | -35.2 |
| 10.0546875 | -31.8 |
| 10.0625 | -30.1 |
| 10.0703125 | -27.4 |
| 10.078125 | -24.2 |
| 10.0859375 | -24.7 |
| 10.09375 | -24.7 |
| 10.1015625 | -18.6 |
| 10.109375 | -14.2 |
| 10.1171875 | -16.8 |
| 10.125 | -20.4 |
| 10.1328125 | -20.9 |
| 10.140625 | -17.4 |
| 10.1484375 | -13 |
| 10.15625 | -10.5 |
| 10.1640625 | -4.2 |
| 10.171875 | 6.1 |
| 10.1796875 | 10.3 |
| 10.1875 | 8 |
| 10.1953125 | 6.1 |
| 10.203125 | 6.1 |
| 10.2109375 | 4.6 |
| 10.21875 | -1.7 |
| 10.2265625 | -8.5 |
| 10.234375 | -12.6 |
| 10.2421875 | -19.3 |
| 10.25 | -26.2 |
| 10.2578125 | -27.1 |
| 10.265625 | -28.3 |
| 10.2734375 | -30.7 |
| 10.28125 | -27.9 |
| 10.2890625 | -28.2 |
| 10.296875 | -35.1 |
| 10.3046875 | -32.1 |
| 10.3125 | -17.6 |
| 10.3203125 | -9.9 |
| 10.328125 | -11 |
| 10.3359375 | -14.2 |
| 10.34375 | -19.8 |
| 10.3515625 | -20 |
| 10.359375 | -12 |
| 10.3671875 | -8 |
| 10.375 | -4.7 |
| 10.3828125 | 4.1 |
| 10.390625 | 7.1 |
| 10.3984375 | 7.4 |
| 10.40625 | 13.3 |
| 10.4140625 | 11.6 |
| 10.421875 | 4.8 |
| 10.4296875 | 10 |
| 10.4375 | 19.8 |
| 10.4453125 | 26.2 |
| 10.453125 | 32 |
| 10.4609375 | 32.1 |
| 10.46875 | 30.3 |
| 10.4765625 | 34.3 |
| 10.484375 | 38.4 |
| 10.4921875 | 40.1 |
| 10.5 | 42.3 |
| 10.5078125 | 44.8 |
| 10.515625 | 48.1 |
| 10.5234375 | 48.1 |
| 10.53125 | 42.4 |
| 10.5390625 | 38.5 |
| 10.546875 | 36.4 |
| 10.5546875 | 27.6 |
| 10.5625 | 16.4 |
| 10.5703125 | 13.1 |
| 10.578125 | 12.3 |
| 10.5859375 | 8.8 |
| 10.59375 | 11.4 |
| 10.6015625 | 18.1 |
| 10.609375 | 17.9 |
| 10.6171875 | 14.5 |
| 10.625 | 12.3 |
| 10.6328125 | 9 |
| 10.640625 | 5.6 |
| 10.6484375 | 2.3 |
| 10.65625 | 3.1 |
| 10.6640625 | 7.8 |
| 10.671875 | 8.4 |
| 10.6796875 | 8.8 |
| 10.6875 | 12.7 |
| 10.6953125 | 14.6 |
| 10.703125 | 18.3 |
| 10.7109375 | 24.7 |
| 10.71875 | 27.1 |
| 10.7265625 | 24.6 |
| 10.734375 | 21.6 |
| 10.7421875 | 24.4 |
| 10.75 | 27.8 |
| 10.7578125 | 22.9 |
| 10.765625 | 17.1 |
| 10.7734375 | 15.1 |
| 10.78125 | 13.4 |
| 10.7890625 | 13.3 |
| 10.796875 | 12.2 |
| 10.8046875 | 10.9 |
| 10.8125 | 13.7 |
| 10.8203125 | 14.6 |
| 10.828125 | 13.7 |
| 10.8359375 | 14.5 |
| 10.84375 | 11.2 |
| 10.8515625 | 4.9 |
| 10.859375 | 0 |
| 10.8671875 | -4.7 |
| 10.875 | -10.1 |
| 10.8828125 | -18.4 |
| 10.890625 | -25.7 |
| 10.8984375 | -26.6 |
| 10.90625 | -29.6 |
| 10.9140625 | -38.8 |
| 10.921875 | -43.7 |
| 10.9296875 | -42.2 |
| 10.9375 | -41.1 |
| 10.9453125 | -39.8 |
| 10.953125 | -34.9 |
| 10.9609375 | -27.6 |
| 10.96875 | -18.4 |
| 10.9765625 | -9.3 |
| 10.984375 | -3 |
| 10.9921875 | 1.6 |
| 11.0 | 4.5 |
| 11.0078125 | 6.9 |
| 11.015625 | 12.2 |
| 11.0234375 | 16.4 |
| 11.03125 | 17.7 |
| 11.0390625 | 17.7 |
| 11.046875 | 13.5 |
| 11.0546875 | 12.1 |
| 11.0625 | 16.2 |
| 11.0703125 | 12.1 |
| 11.078125 | 5.2 |
| 11.0859375 | 7.7 |
| 11.09375 | 12.6 |
| 11.1015625 | 18.3 |
| 11.109375 | 23.3 |
| 11.1171875 | 19.9 |
| 11.125 | 19.2 |
| 11.1328125 | 28 |
| 11.140625 | 34.2 |
| 11.1484375 | 36.7 |
| 11.15625 | 36.1 |
| 11.1640625 | 29.5 |
| 11.171875 | 23 |
| 11.1796875 | 17.8 |
| 11.1875 | 13.8 |
| 11.1953125 | 14 |
| 11.203125 | 11 |
| 11.2109375 | 4.9 |
| 11.21875 | 2.8 |
| 11.2265625 | -2.7 |
| 11.234375 | -8 |
| 11.2421875 | -3.4 |
| 11.25 | -1.6 |
| 11.2578125 | -9 |
| 11.265625 | -15.4 |
| 11.2734375 | -19.7 |
| 11.28125 | -24.2 |
| 11.2890625 | -26 |
| 11.296875 | -26.3 |
| 11.3046875 | -28.9 |
| 11.3125 | -33 |
| 11.3203125 | -35.3 |
| 11.328125 | -37.5 |
| 11.3359375 | -39.5 |
| 11.34375 | -37.2 |
| 11.3515625 | -36.1 |
| 11.359375 | -39.2 |
| 11.3671875 | -36.9 |
| 11.375 | -29.7 |
| 11.3828125 | -25.9 |
| 11.390625 | -23 |
| 11.3984375 | -18.4 |
| 11.40625 | -15.4 |
| 11.4140625 | -15.6 |
| 11.421875 | -17.7 |
| 11.4296875 | -20.1 |
| 11.4375 | -22.9 |
| 11.4453125 | -27.3 |
| 11.453125 | -28.6 |
| 11.4609375 | -24.4 |
| 11.46875 | -22 |
| 11.4765625 | -26 |
| 11.484375 | -30.1 |
| 11.4921875 | -29.7 |
| 11.5 | -30.5 |
| 11.5078125 | -32.6 |
| 11.515625 | -24.9 |
| 11.5234375 | -10.2 |
| 11.53125 | -3.1 |
| 11.5390625 | -0.9 |
| 11.546875 | 5.7 |
| 11.5546875 | 14.3 |
| 11.5625 | 21.1 |
| 11.5703125 | 22.6 |
| 11.578125 | 23.1 |
| 11.5859375 | 29.1 |
| 11.59375 | 33 |
| 11.6015625 | 31.4 |
| 11.609375 | 33.4 |
| 11.6171875 | 34.5 |
| 11.625 | 28.1 |
| 11.6328125 | 21.7 |
| 11.640625 | 19.9 |
| 11.6484375 | 16.7 |
| 11.65625 | 8.3 |
| 11.6640625 | -1 |
| 11.671875 | -6.7 |
| 11.6796875 | -12.3 |
| 11.6875 | -16.4 |
| 11.6953125 | -13.3 |
| 11.703125 | -9.9 |
| 11.7109375 | -12.9 |
| 11.71875 | -16.3 |
| 11.7265625 | -17.4 |
| 11.734375 | -17.6 |
| 11.7421875 | -14.1 |
| 11.75 | -9 |
| 11.7578125 | -8.4 |
| 11.765625 | -10.8 |
| 11.7734375 | -10.8 |
| 11.78125 | -10.4 |
| 11.7890625 | -13 |
| 11.796875 | -14.6 |
| 11.8046875 | -13.5 |
| 11.8125 | -14.8 |
| 11.8203125 | -19.3 |
| 11.828125 | -22.4 |
| 11.8359375 | -23.5 |
| 11.84375 | -26.6 |
| 11.8515625 | -30.8 |
| 11.859375 | -31.7 |
| 11.8671875 | -32.7 |
| 11.875 | -36.2 |
| 11.8828125 | -36.6 |
| 11.890625 | -33 |
| 11.8984375 | -27.7 |
| 11.90625 | -20.8 |
| 11.9140625 | -16.7 |
| 11.921875 | -16.5 |
| 11.9296875 | -14.9 |
| 11.9375 | -12.3 |
| 11.9453125 | -12.8 |
| 11.953125 | -13.8 |
| 11.9609375 | -10.9 |
| 11.96875 | -6.3 |
| 11.9765625 | -2.6 |
| 11.984375 | -0.4 |
| 11.9921875 | 1.5 |
| 12.0 | 6.7 |
| 12.0078125 | 12.7 |
| 12.015625 | 18.8 |
| 12.0234375 | 30.7 |
| 12.03125 | 38.7 |
| 12.0390625 | 37.1 |
| 12.046875 | 42.5 |
| 12.0546875 | 51.2 |
| 12.0625 | 49.4 |
| 12.0703125 | 45.6 |
| 12.078125 | 42.2 |
| 12.0859375 | 34.7 |
| 12.09375 | 28.7 |
| 12.1015625 | 24.3 |
| 12.109375 | 19.8 |
| 12.1171875 | 15.9 |
| 12.125 | 12 |
| 12.1328125 | 13.3 |
| 12.140625 | 16.9 |
| 12.1484375 | 13.8 |
| 12.15625 | 9.9 |
| 12.1640625 | 10.7 |
| 12.171875 | 11.2 |
| 12.1796875 | 13.6 |
| 12.1875 | 22.4 |
| 12.1953125 | 29.7 |
| 12.203125 | 29.1 |
| 12.2109375 | 27.4 |
| 12.21875 | 26.2 |
| 12.2265625 | 20.4 |
| 12.234375 | 14 |
| 12.2421875 | 11.4 |
| 12.25 | 7.9 |
| 12.2578125 | 4.3 |
| 12.265625 | 4.8 |
| 12.2734375 | 7.7 |
| 12.28125 | 10.6 |
| 12.2890625 | 14.1 |
| 12.296875 | 19.2 |
| 12.3046875 | 25.4 |
| 12.3125 | 30.9 |
| 12.3203125 | 34.3 |
| 12.328125 | 34.6 |
| 12.3359375 | 33.6 |
| 12.34375 | 33.3 |
| 12.3515625 | 30.4 |
| 12.359375 | 26.3 |
| 12.3671875 | 25.7 |
| 12.375 | 20.6 |
| 12.3828125 | 7.5 |
| 12.390625 | -2.7 |
| 12.3984375 | -8.3 |
| 12.40625 | -12.2 |
| 12.4140625 | -10.7 |
| 12.421875 | -9.4 |
| 12.4296875 | -14 |
| 12.4375 | -14.9 |
| 12.4453125 | -11 |
| 12.453125 | -11.6 |
| 12.4609375 | -9.8 |
| 12.46875 | 2.5 |
| 12.4765625 | 13.7 |
| 12.484375 | 14.9 |
| 12.4921875 | 10.7 |
| 12.5 | 7 |
| 12.5078125 | 6.5 |
| 12.515625 | 9 |
| 12.5234375 | 12.7 |
| 12.53125 | 11.7 |
| 12.5390625 | 3.3 |
| 12.546875 | -1.8 |
| 12.5546875 | -0.4 |
| 12.5625 | -1.6 |
| 12.5703125 | -3.9 |
| 12.578125 | -5.2 |
| 12.5859375 | -8.8 |
| 12.59375 | -10.6 |
| 12.6015625 | -11.3 |
| 12.609375 | -12.3 |
| 12.6171875 | -12.1 |
| 12.625 | -14.4 |
| 12.6328125 | -14.4 |
| 12.640625 | -12.1 |
| 12.6484375 | -16.6 |
| 12.65625 | -19.5 |
| 12.6640625 | -18.5 |
| 12.671875 | -19.6 |
| 12.6796875 | -13.5 |
| 12.6875 | -6.1 |
| 12.6953125 | -5.8 |
| 12.703125 | -4.7 |
| 12.7109375 | -8.7 |
| 12.71875 | -13.9 |
| 12.7265625 | -6.4 |
| 12.734375 | 0.4 |
| 12.7421875 | 2.1 |
| 12.75 | 5.6 |
| 12.7578125 | 3.2 |
| 12.765625 | 1.9 |
| 12.7734375 | 7.2 |
| 12.78125 | 6.3 |
| 12.7890625 | 1.9 |
| 12.796875 | -0.7 |
| 12.8046875 | -4.5 |
| 12.8125 | -3.9 |
| 12.8203125 | -1 |
| 12.828125 | -2.4 |
| 12.8359375 | -3.9 |
| 12.84375 | -4.1 |
| 12.8515625 | -5.3 |
| 12.859375 | -9.2 |
| 12.8671875 | -14.2 |
| 12.875 | -14.3 |
| 12.8828125 | -11.5 |
| 12.890625 | -9.6 |
| 12.8984375 | -5.6 |
| 12.90625 | -5.5 |
| 12.9140625 | -13.1 |
| 12.921875 | -17.2 |
| 12.9296875 | -14.3 |
| 12.9375 | -11.2 |
| 12.9453125 | -7.8 |
| 12.953125 | -4.1 |
| 12.9609375 | -2.4 |
| 12.96875 | -4.5 |
| 12.9765625 | -10.3 |
| 12.984375 | -13 |
| 12.9921875 | -9 |
| 13.0 | -5.3 |
| 13.0078125 | -1.7 |
| 13.015625 | 4.6 |
| 13.0234375 | 5.6 |
| 13.03125 | 2.9 |
| 13.0390625 | 4.5 |
| 13.046875 | 5 |
| 13.0546875 | 2 |
| 13.0625 | 0.7 |
| 13.0703125 | 1.4 |
| 13.078125 | 6.1 |
| 13.0859375 | 13.4 |
| 13.09375 | 14.7 |
| 13.1015625 | 12.3 |
| 13.109375 | 13.4 |
| 13.1171875 | 13.9 |
| 13.125 | 12.2 |
| 13.1328125 | 14.4 |
| 13.140625 | 18.7 |
| 13.1484375 | 20 |
| 13.15625 | 21.1 |
| 13.1640625 | 24.1 |
| 13.171875 | 24.1 |
| 13.1796875 | 20.3 |
| 13.1875 | 13.9 |
| 13.1953125 | 2.7 |
| 13.203125 | -7 |
| 13.2109375 | -11.1 |
| 13.21875 | -18.8 |
| 13.2265625 | -29.6 |
| 13.234375 | -34.1 |
| 13.2421875 | -29.5 |
| 13.25 | -20.3 |
| 13.2578125 | -20.1 |
| 13.265625 | -31.2 |
| 13.2734375 | -40 |
| 13.28125 | -45.9 |
| 13.2890625 | -50.7 |
| 13.296875 | -48.5 |
| 13.3046875 | -46.7 |
| 13.3125 | -48.8 |
| 13.3203125 | -48.5 |
| 13.328125 | -49.3 |
| 13.3359375 | -52.3 |
| 13.34375 | -54.5 |
| 13.3515625 | -53.2 |
| 13.359375 | -39.6 |
| 13.3671875 | -19.9 |
| 13.375 | -3.9 |
| 13.3828125 | 16.4 |
| 13.390625 | 33.6 |
| 13.3984375 | 31.5 |
| 13.40625 | 20.2 |
| 13.4140625 | 10.7 |
| 13.421875 | 5.8 |
| 13.4296875 | 11.4 |
| 13.4375 | 20.3 |
| 13.4453125 | 25.4 |
| 13.453125 | 32.4 |
| 13.4609375 | 34.6 |
| 13.46875 | 24.3 |
| 13.4765625 | 15.5 |
| 13.484375 | 13.3 |
| 13.4921875 | 8.3 |
| 13.5 | 6.6 |
| 13.5078125 | 12.4 |
| 13.515625 | 15.4 |
| 13.5234375 | 15.2 |
| 13.53125 | 16.1 |
| 13.5390625 | 13.2 |
| 13.546875 | 6.9 |
| 13.5546875 | 0.8 |
| 13.5625 | -4.5 |
| 13.5703125 | -6.8 |
| 13.578125 | -4.8 |
| 13.5859375 | 0.6 |
| 13.59375 | 7.8 |
| 13.6015625 | 13.3 |
| 13.609375 | 17.2 |
| 13.6171875 | 18.7 |
| 13.625 | 17.3 |
| 13.6328125 | 18 |
| 13.640625 | 18.6 |
| 13.6484375 | 15.3 |
| 13.65625 | 13.9 |
| 13.6640625 | 15.4 |
| 13.671875 | 18 |
| 13.6796875 | 25.1 |
| 13.6875 | 32.9 |
| 13.6953125 | 36.5 |
| 13.703125 | 36.5 |
| 13.7109375 | 30.4 |
| 13.71875 | 19.9 |
| 13.7265625 | 11.8 |
| 13.734375 | 8.7 |
| 13.7421875 | 5.5 |
| 13.75 | -1.3 |
| 13.7578125 | 0 |
| 13.765625 | 13.1 |
| 13.7734375 | 18.9 |
| 13.78125 | 13.9 |
| 13.7890625 | 9.2 |
| 13.796875 | 2.4 |
| 13.8046875 | -5.3 |
| 13.8125 | -8.7 |
| 13.8203125 | -11.5 |
| 13.828125 | -13.6 |
| 13.8359375 | -14.7 |
| 13.84375 | -16.3 |
| 13.8515625 | -13.6 |
| 13.859375 | -8 |
| 13.8671875 | -8.9 |
| 13.875 | -16.7 |
| 13.8828125 | -23.7 |
| 13.890625 | -27.9 |
| 13.8984375 | -28.3 |
| 13.90625 | -17.2 |
| 13.9140625 | 1.3 |
| 13.921875 | 14.6 |
| 13.9296875 | 23 |
| 13.9375 | 27.6 |
| 13.9453125 | 25.5 |
| 13.953125 | 19.8 |
| 13.9609375 | 9.7 |
| 13.96875 | -5.1 |
| 13.9765625 | -13.7 |
| 13.984375 | -14 |
| 13.9921875 | -14.9 |
| 14.0 | -16.8 |
| 14.0078125 | -15 |
| 14.015625 | -14.4 |
| 14.0234375 | -20.9 |
| 14.03125 | -29.4 |
| 14.0390625 | -35.7 |
| 14.046875 | -40.4 |
| 14.0546875 | -39.6 |
| 14.0625 | -36.4 |
| 14.0703125 | -36 |
| 14.078125 | -31.2 |
| 14.0859375 | -22.7 |
| 14.09375 | -16.2 |
| 14.1015625 | -6.3 |
| 14.109375 | 4.7 |
| 14.1171875 | 6.8 |
| 14.125 | -1.3 |
| 14.1328125 | -13.9 |
| 14.140625 | -22 |
| 14.1484375 | -23.1 |
| 14.15625 | -21.6 |
| 14.1640625 | -21.5 |
| 14.171875 | -29.2 |
| 14.1796875 | -41.7 |
| 14.1875 | -44.9 |
| 14.1953125 | -42.6 |
| 14.203125 | -44.9 |
| 14.2109375 | -42.9 |
| 14.21875 | -33.5 |
| 14.2265625 | -26 |
| 14.234375 | -19.2 |
| 14.2421875 | -11 |
| 14.25 | -5.1 |
| 14.2578125 | 2.5 |
| 14.265625 | 11.5 |
| 14.2734375 | 14.6 |
| 14.28125 | 17.2 |
| 14.2890625 | 20.2 |
| 14.296875 | 13.4 |
| 14.3046875 | 3.3 |
| 14.3125 | -2.1 |
| 14.3203125 | -10.6 |
| 14.328125 | -17 |
| 14.3359375 | -13.9 |
| 14.34375 | -10.8 |
| 14.3515625 | -7.7 |
| 14.359375 | -1.9 |
| 14.3671875 | -1.6 |
| 14.375 | -0.4 |
| 14.3828125 | 5.9 |
| 14.390625 | 2.9 |
| 14.3984375 | -3.9 |
| 14.40625 | -0.1 |
| 14.4140625 | 4.9 |
| 14.421875 | 4.5 |
| 14.4296875 | 6.8 |
| 14.4375 | 13.7 |
| 14.4453125 | 20.2 |
| 14.453125 | 18.1 |
| 14.4609375 | 9.9 |
| 14.46875 | 11 |
| 14.4765625 | 18.5 |
| 14.484375 | 19.8 |
| 14.4921875 | 18.3 |
| 14.5 | 15.6 |
| 14.5078125 | 11.6 |
| 14.515625 | 9.9 |
| 14.5234375 | 6.1 |
| 14.53125 | 2 |
| 14.5390625 | 4.1 |
| 14.546875 | 5.9 |
| 14.5546875 | 4.3 |
| 14.5625 | 3.2 |
| 14.5703125 | 2.3 |
| 14.578125 | 3.2 |
| 14.5859375 | 2.9 |
| 14.59375 | -2.4 |
| 14.6015625 | -5.7 |
| 14.609375 | -6.2 |
| 14.6171875 | -8 |
| 14.625 | -8.5 |
| 14.6328125 | -8.1 |
| 14.640625 | -7.5 |
| 14.6484375 | -8 |
| 14.65625 | -10.9 |
| 14.6640625 | -7.5 |
| 14.671875 | -0.9 |
| 14.6796875 | -4.4 |
| 14.6875 | -9.3 |
| 14.6953125 | -5.7 |
| 14.703125 | -1 |
| 14.7109375 | 3.5 |
| 14.71875 | 6.1 |
| 14.7265625 | 3.7 |
| 14.734375 | 5.5 |
| 14.7421875 | 10.8 |
| 14.75 | 9.4 |
| 14.7578125 | 8.2 |
| 14.765625 | 12.2 |
| 14.7734375 | 14 |
| 14.78125 | 16 |
| 14.7890625 | 19.2 |
| 14.796875 | 16.4 |
| 14.8046875 | 14.5 |
| 14.8125 | 18.7 |
| 14.8203125 | 19.6 |
| 14.828125 | 18.8 |
| 14.8359375 | 22.5 |
| 14.84375 | 24.9 |
| 14.8515625 | 24.4 |
| 14.859375 | 23.7 |
| 14.8671875 | 20.6 |
| 14.875 | 16.9 |
| 14.8828125 | 14.5 |
| 14.890625 | 11.5 |
| 14.8984375 | 8.7 |
| 14.90625 | 8.7 |
| 14.9140625 | 14.4 |
| 14.921875 | 21.9 |
| 14.9296875 | 24.6 |
| 14.9375 | 26.5 |
| 14.9453125 | 30.5 |
| 14.953125 | 31.5 |
| 14.9609375 | 31.8 |
| 14.96875 | 33.1 |
| 14.9765625 | 31.6 |
| 14.984375 | 32 |
| 14.9921875 | 35.2 |
| 15.0 | 34.4 |
| 15.0078125 | 34.5 |
| 15.015625 | 39.1 |
| 15.0234375 | 40.3 |
| 15.03125 | 39.6 |
| 15.0390625 | 42.2 |
| 15.046875 | 44.7 |
| 15.0546875 | 46.7 |
| 15.0625 | 48 |
| 15.0703125 | 47.4 |
| 15.078125 | 48.5 |
| 15.0859375 | 50.1 |
| 15.09375 | 49.7 |
| 15.1015625 | 51.2 |
| 15.109375 | 52.5 |
| 15.1171875 | 51.8 |
| 15.125 | 53.6 |
| 15.1328125 | 53.1 |
| 15.140625 | 46.1 |
| 15.1484375 | 36.9 |
| 15.15625 | 26.8 |
| 15.1640625 | 16.1 |
| 15.171875 | 7.6 |
| 15.1796875 | 0.2 |
| 15.1875 | -7.1 |
| 15.1953125 | -13.5 |
| 15.203125 | -19.2 |
| 15.2109375 | -25 |
| 15.21875 | -29.5 |
| 15.2265625 | -31.3 |
| 15.234375 | -29.8 |
| 15.2421875 | -21.4 |
| 15.25 | -10 |
| 15.2578125 | -5.5 |
| 15.265625 | -5.8 |
| 15.2734375 | -7.1 |
| 15.28125 | -11.1 |
| 15.2890625 | -11.5 |
| 15.296875 | -5 |
| 15.3046875 | -1.4 |
| 15.3125 | -6 |
| 15.3203125 | -13.4 |
| 15.328125 | -15.5 |
| 15.3359375 | -14.3 |
| 15.34375 | -19.3 |
| 15.3515625 | -24.2 |
| 15.359375 | -21 |
| 15.3671875 | -18.9 |
| 15.375 | -21.7 |
| 15.3828125 | -22.6 |
| 15.390625 | -19 |
| 15.3984375 | -16.7 |
| 15.40625 | -22.1 |
| 15.4140625 | -27.7 |
| 15.421875 | -27.2 |
| 15.4296875 | -29.3 |
| 15.4375 | -31.5 |
| 15.4453125 | -26.7 |
| 15.453125 | -24.6 |
| 15.4609375 | -28.1 |
| 15.46875 | -31.5 |
| 15.4765625 | -36 |
| 15.484375 | -37.9 |
| 15.4921875 | -34.7 |
| 15.5 | -34 |
| 15.5078125 | -35.4 |
| 15.515625 | -32.7 |
| 15.5234375 | -29.8 |
| 15.53125 | -31.5 |
| 15.5390625 | -31.6 |
| 15.546875 | -28.3 |
| 15.5546875 | -30.1 |
| 15.5625 | -32.6 |
| 15.5703125 | -27.6 |
| 15.578125 | -25.2 |
| 15.5859375 | -31.5 |
| 15.59375 | -38.1 |
| 15.6015625 | -41.7 |
| 15.609375 | -42.3 |
| 15.6171875 | -41.2 |
| 15.625 | -42.8 |
| 15.6328125 | -42.7 |
| 15.640625 | -36.1 |
| 15.6484375 | -30 |
| 15.65625 | -25.9 |
| 15.6640625 | -16.6 |
| 15.671875 | -5.7 |
| 15.6796875 | -1.6 |
| 15.6875 | -4 |
| 15.6953125 | -9.2 |
| 15.703125 | -14.9 |
| 15.7109375 | -18 |
| 15.71875 | -19 |
| 15.7265625 | -20.2 |
| 15.734375 | -22.7 |
| 15.7421875 | -25.5 |
| 15.75 | -24.9 |
| 15.7578125 | -22.3 |
| 15.765625 | -20.7 |
| 15.7734375 | -16.2 |
| 15.78125 | -11.5 |
| 15.7890625 | -9.4 |
| 15.796875 | -1.9 |
| 15.8046875 | 6.2 |
| 15.8125 | 7.8 |
| 15.8203125 | 11.6 |
| 15.828125 | 16 |
| 15.8359375 | 14.9 |
| 15.84375 | 13.3 |
| 15.8515625 | 11.3 |
| 15.859375 | 10.7 |
| 15.8671875 | 13.8 |
| 15.875 | 14.2 |
| 15.8828125 | 16 |
| 15.890625 | 18.3 |
| 15.8984375 | 10.5 |
| 15.90625 | 3.5 |
| 15.9140625 | 2.1 |
| 15.921875 | -3.3 |
| 15.9296875 | -3.3 |
| 15.9375 | 4 |
| 15.9453125 | 7.9 |
| 15.953125 | 13.6 |
| 15.9609375 | 21 |
| 15.96875 | 24.1 |
| 15.9765625 | 27.6 |
| 15.984375 | 29.3 |
| 15.9921875 | 27.7 |
| 16.0 | 31.5 |
| 16.0078125 | 35.3 |
| 16.015625 | 30.8 |
| 16.0234375 | 25.8 |
| 16.03125 | 25.1 |
| 16.0390625 | 22.5 |
| 16.046875 | 18.2 |
| 16.0546875 | 18.6 |
| 16.0625 | 23.5 |
| 16.0703125 | 27.3 |
| 16.078125 | 24.6 |
| 16.0859375 | 17.7 |
| 16.09375 | 15.2 |
| 16.1015625 | 14.9 |
| 16.109375 | 11.2 |
| 16.1171875 | 9.9 |
| 16.125 | 10.1 |
| 16.1328125 | 9.1 |
| 16.140625 | 13 |
| 16.1484375 | 17.9 |
| 16.15625 | 18.3 |
| 16.1640625 | 19.3 |
| 16.171875 | 19.7 |
| 16.1796875 | 17.3 |
| 16.1875 | 16.5 |
| 16.1953125 | 16.7 |
| 16.203125 | 14.9 |
| 16.2109375 | 8.7 |
| 16.21875 | -1.1 |
| 16.2265625 | -8.5 |
| 16.234375 | -12 |
| 16.2421875 | -14.6 |
| 16.25 | -19.6 |
| 16.2578125 | -26.9 |
| 16.265625 | -29.2 |
| 16.2734375 | -27.6 |
| 16.28125 | -29.6 |
| 16.2890625 | -31.8 |
| 16.296875 | -31.4 |
| 16.3046875 | -32.4 |
| 16.3125 | -32.1 |
| 16.3203125 | -29.7 |
| 16.328125 | -33 |
| 16.3359375 | -39.9 |
| 16.34375 | -38.7 |
| 16.3515625 | -32 |
| 16.359375 | -26.7 |
| 16.3671875 | -21.2 |
| 16.375 | -16.5 |
| 16.3828125 | -11 |
| 16.390625 | -1.9 |
| 16.3984375 | 3.8 |
| 16.40625 | 8 |
| 16.4140625 | 12.8 |
| 16.421875 | 9.7 |
| 16.4296875 | 6.2 |
| 16.4375 | 7.8 |
| 16.4453125 | 1.7 |
| 16.453125 | -8.7 |
| 16.4609375 | -16.4 |
| 16.46875 | -26.7 |
| 16.4765625 | -33.6 |
| 16.484375 | -30.8 |
| 16.4921875 | -27.1 |
| 16.5 | -25.7 |
| 16.5078125 | -22.2 |
| 16.515625 | -17.4 |
| 16.5234375 | -10 |
| 16.53125 | 4.7 |
| 16.5390625 | 21.3 |
| 16.546875 | 30 |
| 16.5546875 | 33.5 |
| 16.5625 | 38.9 |
| 16.5703125 | 47.4 |
| 16.578125 | 57 |
| 16.5859375 | 62.2 |
| 16.59375 | 62 |
| 16.6015625 | 61.7 |
| 16.609375 | 62.5 |
| 16.6171875 | 62.1 |
| 16.625 | 61.5 |
| 16.6328125 | 62.1 |
| 16.640625 | 64 |
| 16.6484375 | 67.9 |
| 16.65625 | 70.9 |
| 16.6640625 | 66.6 |
| 16.671875 | 57.2 |
| 16.6796875 | 50.3 |
| 16.6875 | 44.4 |
| 16.6953125 | 38.9 |
| 16.703125 | 36 |
| 16.7109375 | 30 |
| 16.71875 | 21.4 |
| 16.7265625 | 18.8 |
| 16.734375 | 18.6 |
| 16.7421875 | 17.7 |
| 16.75 | 21.8 |
| 16.7578125 | 24.9 |
| 16.765625 | 20.8 |
| 16.7734375 | 16.5 |
| 16.78125 | 10.1 |
| 16.7890625 | -3.7 |
| 16.796875 | -16.8 |
| 16.8046875 | -23.1 |
| 16.8125 | -20.7 |
| 16.8203125 | -11.1 |
| 16.828125 | -3.6 |
| 16.8359375 | 0.7 |
| 16.84375 | 5.1 |
| 16.8515625 | 6 |
| 16.859375 | 5.3 |
| 16.8671875 | 5.5 |
| 16.875 | 4.3 |
| 16.8828125 | 1.6 |
| 16.890625 | -4.1 |
| 16.8984375 | -12.6 |
| 16.90625 | -17.3 |
| 16.9140625 | -16.4 |
| 16.921875 | -16.5 |
| 16.9296875 | -23.3 |
| 16.9375 | -26.7 |
| 16.9453125 | -18.3 |
| 16.953125 | -13 |
| 16.9609375 | -16.4 |
| 16.96875 | -16.2 |
| 16.9765625 | -12.5 |
| 16.984375 | -8 |
| 16.9921875 | -4.6 |
| 17.0 | -9.6 |
| 17.0078125 | -15.4 |
| 17.015625 | -14.8 |
| 17.0234375 | -15.2 |
| 17.03125 | -14.7 |
| 17.0390625 | -12.6 |
| 17.046875 | -14.4 |
| 17.0546875 | -15.8 |
| 17.0625 | -19.2 |
| 17.0703125 | -26.8 |
| 17.078125 | -26.5 |
| 17.0859375 | -23.3 |
| 17.09375 | -30.4 |
| 17.1015625 | -39.1 |
| 17.109375 | -39.8 |
| 17.1171875 | -35.3 |
| 17.125 | -32.6 |
| 17.1328125 | -36.9 |
| 17.140625 | -39.3 |
| 17.1484375 | -34.6 |
| 17.15625 | -36.1 |
| 17.1640625 | -44.1 |
| 17.171875 | -45.8 |
| 17.1796875 | -44.3 |
| 17.1875 | -44.8 |
| 17.1953125 | -45.2 |
| 17.203125 | -45 |
| 17.2109375 | -42.8 |
| 17.21875 | -36 |
| 17.2265625 | -28.5 |
| 17.234375 | -25.5 |
| 17.2421875 | -24.4 |
| 17.25 | -23.4 |
| 17.2578125 | -24.5 |
| 17.265625 | -27.1 |
| 17.2734375 | -29.2 |
| 17.28125 | -28.5 |
| 17.2890625 | -24 |
| 17.296875 | -22.4 |
| 17.3046875 | -23.2 |
| 17.3125 | -17.3 |
| 17.3203125 | -10.2 |
| 17.328125 | -6.4 |
| 17.3359375 | 3.8 |
| 17.34375 | 16.9 |
| 17.3515625 | 24.6 |
| 17.359375 | 29.9 |
| 17.3671875 | 31.4 |
| 17.375 | 28.7 |
| 17.3828125 | 24 |
| 17.390625 | 15.8 |
| 17.3984375 | 10.7 |
| 17.40625 | 8 |
| 17.4140625 | -3.2 |
| 17.421875 | -15.2 |
| 17.4296875 | -20.8 |
| 17.4375 | -26.1 |
| 17.4453125 | -29.8 |
| 17.453125 | -33 |
| 17.4609375 | -38.1 |
| 17.46875 | -38.1 |
| 17.4765625 | -34.6 |
| 17.484375 | -31.9 |
| 17.4921875 | -25.8 |
| 17.5 | -17.5 |
| 17.5078125 | -11.9 |
| 17.515625 | -9.3 |
| 17.5234375 | -5.4 |
| 17.53125 | 2.6 |
| 17.5390625 | 7.1 |
| 17.546875 | 4.4 |
| 17.5546875 | 2.1 |
| 17.5625 | 1.3 |
| 17.5703125 | 2.4 |
| 17.578125 | 9.7 |
| 17.5859375 | 17 |
| 17.59375 | 19.8 |
| 17.6015625 | 22.6 |
| 17.609375 | 25.9 |
| 17.6171875 | 26.6 |
| 17.625 | 23.6 |
| 17.6328125 | 21.1 |
| 17.640625 | 21.2 |
| 17.6484375 | 15.2 |
| 17.65625 | 5.6 |
| 17.6640625 | 2.9 |
| 17.671875 | 1.7 |
| 17.6796875 | 0.7 |
| 17.6875 | 3.5 |
| 17.6953125 | 1.5 |
| 17.703125 | -2.6 |
| 17.7109375 | -4.8 |
| 17.71875 | -14.4 |
| 17.7265625 | -23.3 |
| 17.734375 | -21.5 |
| 17.7421875 | -19.2 |
| 17.75 | -17.4 |
| 17.7578125 | -10.1 |
| 17.765625 | -3.6 |
| 17.7734375 | 1.5 |
| 17.78125 | 7.9 |
| 17.7890625 | 9 |
| 17.796875 | 6.4 |
| 17.8046875 | 9.6 |
| 17.8125 | 15 |
| 17.8203125 | 17.7 |
| 17.828125 | 27.6 |
| 17.8359375 | 44.2 |
| 17.84375 | 54.4 |
| 17.8515625 | 58.5 |
| 17.859375 | 60.1 |
| 17.8671875 | 56.4 |
| 17.875 | 50.1 |
| 17.8828125 | 43.9 |
| 17.890625 | 37.1 |
| 17.8984375 | 30.3 |
| 17.90625 | 22.5 |
| 17.9140625 | 16.8 |
| 17.921875 | 13.5 |
| 17.9296875 | 8 |
| 17.9375 | 5.9 |
| 17.9453125 | 7.9 |
| 17.953125 | 5.4 |
| 17.9609375 | 5.2 |
| 17.96875 | 9.2 |
| 17.9765625 | 5.3 |
| 17.984375 | -1.1 |
| 17.9921875 | -0.1 |
| 18.0 | 4.2 |
| 18.0078125 | 7.9 |
| 18.015625 | 7.9 |
| 18.0234375 | 5.7 |
| 18.03125 | 7.2 |
| 18.0390625 | 8.6 |
| 18.046875 | 7.2 |
| 18.0546875 | 7.3 |
| 18.0625 | 5.9 |
| 18.0703125 | 3.6 |
| 18.078125 | 7.1 |
| 18.0859375 | 10.9 |
| 18.09375 | 6.9 |
| 18.1015625 | 1.3 |
| 18.109375 | 3.1 |
| 18.1171875 | 7.9 |
| 18.125 | 10 |
| 18.1328125 | 12 |
| 18.140625 | 14 |
| 18.1484375 | 12.8 |
| 18.15625 | 9.2 |
| 18.1640625 | 8.8 |
| 18.171875 | 9.1 |
| 18.1796875 | -0.2 |
| 18.1875 | -12.2 |
| 18.1953125 | -13.3 |
| 18.203125 | -13.5 |
| 18.2109375 | -20.1 |
| 18.21875 | -23.1 |
| 18.2265625 | -21.2 |
| 18.234375 | -20.5 |
| 18.2421875 | -23.3 |
| 18.25 | -25.2 |
| 18.2578125 | -19 |
| 18.265625 | -11.4 |
| 18.2734375 | -7.3 |
| 18.28125 | 1.2 |
| 18.2890625 | 12.4 |
| 18.296875 | 18.4 |
| 18.3046875 | 17.6 |
| 18.3125 | 14.6 |
| 18.3203125 | 16.6 |
| 18.328125 | 18.3 |
| 18.3359375 | 14.7 |
| 18.34375 | 13 |
| 18.3515625 | 11.2 |
| 18.359375 | 8.3 |
| 18.3671875 | 8.1 |
| 18.375 | 3.6 |
| 18.3828125 | -2.9 |
| 18.390625 | -4.7 |
| 18.3984375 | -10.8 |
| 18.40625 | -19.3 |
| 18.4140625 | -19 |
| 18.421875 | -12.6 |
| 18.4296875 | -4.5 |
| 18.4375 | 4.4 |
| 18.4453125 | 10.4 |
| 18.453125 | 10.6 |
| 18.4609375 | 6 |
| 18.46875 | 3.3 |
| 18.4765625 | 2.2 |
| 18.484375 | -6 |
| 18.4921875 | -13.3 |
| 18.5 | -9.3 |
| 18.5078125 | -6.8 |
| 18.515625 | -12.5 |
| 18.5234375 | -16.4 |
| 18.53125 | -17.7 |
| 18.5390625 | -20.3 |
| 18.546875 | -24.8 |
| 18.5546875 | -27.4 |
| 18.5625 | -20.7 |
| 18.5703125 | -9.9 |
| 18.578125 | -2.2 |
| 18.5859375 | 8.4 |
| 18.59375 | 16.5 |
| 18.6015625 | 15.3 |
| 18.609375 | 13.8 |
| 18.6171875 | 12.2 |
| 18.625 | 9.1 |
| 18.6328125 | 10.5 |
| 18.640625 | 11.1 |
| 18.6484375 | 13.2 |
| 18.65625 | 23 |
| 18.6640625 | 24.6 |
| 18.671875 | 19.5 |
| 18.6796875 | 28.5 |
| 18.6875 | 38.1 |
| 18.6953125 | 34.5 |
| 18.703125 | 33.4 |
| 18.7109375 | 35.6 |
| 18.71875 | 34.7 |
| 18.7265625 | 39.1 |
| 18.734375 | 48.7 |
| 18.7421875 | 54.1 |
| 18.75 | 51.7 |
| 18.7578125 | 45.7 |
| 18.765625 | 42.3 |
| 18.7734375 | 38.6 |
| 18.78125 | 33.7 |
| 18.7890625 | 32.8 |
| 18.796875 | 31.2 |
| 18.8046875 | 25.7 |
| 18.8125 | 18.8 |
| 18.8203125 | 9.8 |
| 18.828125 | 0.7 |
| 18.8359375 | -8.9 |
| 18.84375 | -19.8 |
| 18.8515625 | -27.2 |
| 18.859375 | -30.2 |
| 18.8671875 | -30.2 |
| 18.875 | -29.5 |
| 18.8828125 | -30.1 |
| 18.890625 | -28.3 |
| 18.8984375 | -30.2 |
| 18.90625 | -41.8 |
| 18.9140625 | -48.5 |
| 18.921875 | -45.7 |
| 18.9296875 | -42.2 |
| 18.9375 | -36 |
| 18.9453125 | -30.9 |
| 18.953125 | -27.9 |
| 18.9609375 | -13.3 |
| 18.96875 | 12.1 |
| 18.9765625 | 36.1 |
| 18.984375 | 57.3 |
| 18.9921875 | 75.7 |
| 19.0 | 89 |
| 19.0078125 | 98.2 |
| 19.015625 | 100.1 |
| 19.0234375 | 89.6 |
| 19.03125 | 75.8 |
| 19.0390625 | 73.3 |
| 19.046875 | 77.3 |
| 19.0546875 | 72.4 |
| 19.0625 | 58.8 |
| 19.0703125 | 41.6 |
| 19.078125 | 19.3 |
| 19.0859375 | -2.7 |
| 19.09375 | -18.6 |
| 19.1015625 | -34.9 |
| 19.109375 | -52.7 |
| 19.1171875 | -61.4 |
| 19.125 | -57.6 |
| 19.1328125 | -46.9 |
| 19.140625 | -29.3 |
| 19.1484375 | -0.4 |
| 19.15625 | 34.5 |
| 19.1640625 | 64.4 |
| 19.171875 | 90.5 |
| 19.1796875 | 116.2 |
| 19.1875 | 133.1 |
| 19.1953125 | 137.4 |
| 19.203125 | 134.3 |
| 19.2109375 | 126.7 |
| 19.21875 | 114.2 |
| 19.2265625 | 93.7 |
| 19.234375 | 64.6 |
| 19.2421875 | 35.8 |
| 19.25 | 12.5 |
| 19.2578125 | -9.9 |
| 19.265625 | -33.7 |
| 19.2734375 | -57.4 |
| 19.28125 | -82.3 |
| 19.2890625 | -109.9 |
| 19.296875 | -136.3 |
| 19.3046875 | -154.9 |
| 19.3125 | -164.6 |
| 19.3203125 | -169.6 |
| 19.328125 | -173.3 |
| 19.3359375 | -181.2 |
| 19.34375 | -198.7 |
| 19.3515625 | -219.4 |
| 19.359375 | -232.9 |
| 19.3671875 | -234.7 |
| 19.375 | -223 |
| 19.3828125 | -206.3 |
| 19.390625 | -198.5 |
| 19.3984375 | -201.9 |
| 19.40625 | -211.6 |
| 19.4140625 | -217.3 |
| 19.421875 | -207.3 |
| 19.4296875 | -185.4 |
| 19.4375 | -159.7 |
| 19.4453125 | -135.3 |
| 19.453125 | -120.9 |
| 19.4609375 | -116.4 |
| 19.46875 | -118.6 |
| 19.4765625 | -127.1 |
| 19.484375 | -128.7 |
| 19.4921875 | -112.5 |
| 19.5 | -87.5 |
| 19.5078125 | -63.5 |
| 19.515625 | -46.4 |
| 19.5234375 | -43.9 |
| 19.53125 | -55.2 |
| 19.5390625 | -71.2 |
| 19.546875 | -83.1 |
| 19.5546875 | -84.3 |
| 19.5625 | -72.9 |
| 19.5703125 | -50.9 |
| 19.578125 | -23.8 |
| 19.5859375 | -3.3 |
| 19.59375 | 0.7 |
| 19.6015625 | -5.5 |
| 19.609375 | -7.6 |
| 19.6171875 | -3.2 |
| 19.625 | 2.5 |
| 19.6328125 | 7.5 |
| 19.640625 | 11.7 |
| 19.6484375 | 18.4 |
| 19.65625 | 31.9 |
| 19.6640625 | 45.1 |
| 19.671875 | 48 |
| 19.6796875 | 46.2 |
| 19.6875 | 49.6 |
| 19.6953125 | 54.5 |
| 19.703125 | 57 |
| 19.7109375 | 59.1 |
| 19.71875 | 62 |
| 19.7265625 | 70.6 |
| 19.734375 | 87.1 |
| 19.7421875 | 106.1 |
| 19.75 | 124.2 |
| 19.7578125 | 135.6 |
| 19.765625 | 134.2 |
| 19.7734375 | 126.9 |
| 19.78125 | 122.6 |
| 19.7890625 | 122.1 |
| 19.796875 | 125.1 |
| 19.8046875 | 130.5 |
| 19.8125 | 136.7 |
| 19.8203125 | 142.9 |
| 19.828125 | 147.7 |
| 19.8359375 | 149 |
| 19.84375 | 146.6 |
| 19.8515625 | 143.6 |
| 19.859375 | 139.2 |
| 19.8671875 | 129.9 |
| 19.875 | 121.5 |
| 19.8828125 | 116.6 |
| 19.890625 | 108.5 |
| 19.8984375 | 99 |
| 19.90625 | 90.3 |
| 19.9140625 | 80 |
| 19.921875 | 71.4 |
| 19.9296875 | 63.3 |
| 19.9375 | 54.7 |
| 19.9453125 | 53.8 |
| 19.953125 | 56.8 |
| 19.9609375 | 53.5 |
| 19.96875 | 48.4 |
| 19.9765625 | 43.3 |
| 19.984375 | 35.8 |
| 19.9921875 | 32.2 |
| 20.0 | 35.8 |
| 20.0078125 | 39.4 |
| 20.015625 | 37.2 |
| 20.0234375 | 32.5 |
| 20.03125 | 30.8 |
| 20.0390625 | 29.2 |
| 20.046875 | 25.9 |
| 20.0546875 | 23.1 |
| 20.0625 | 19.8 |
| 20.0703125 | 19.1 |
| 20.078125 | 22.8 |
| 20.0859375 | 22.8 |
| 20.09375 | 18.4 |
| 20.1015625 | 13.4 |
| 20.109375 | 8.2 |
| 20.1171875 | 6.6 |
| 20.125 | 5.8 |
| 20.1328125 | -0.2 |
| 20.140625 | -4.1 |
| 20.1484375 | -5.3 |
| 20.15625 | -10.4 |
| 20.1640625 | -12.8 |
| 20.171875 | -11.5 |
| 20.1796875 | -12.8 |
| 20.1875 | -9.2 |
| 20.1953125 | 1.5 |
| 20.203125 | 8.7 |
| 20.2109375 | 12.4 |
| 20.21875 | 13 |
| 20.2265625 | 8.6 |
| 20.234375 | 7 |
| 20.2421875 | 10 |
| 20.25 | 14.6 |
| 20.2578125 | 22.7 |
| 20.265625 | 28.8 |
| 20.2734375 | 32.3 |
| 20.28125 | 38.5 |
| 20.2890625 | 42.5 |
| 20.296875 | 46.3 |
| 20.3046875 | 55.2 |
| 20.3125 | 61.4 |
| 20.3203125 | 65.2 |
| 20.328125 | 71.7 |
| 20.3359375 | 77.2 |
| 20.34375 | 83.6 |
| 20.3515625 | 92.1 |
| 20.359375 | 98 |
| 20.3671875 | 101 |
| 20.375 | 103.2 |
| 20.3828125 | 108.4 |
| 20.390625 | 113.2 |
| 20.3984375 | 105.4 |
| 20.40625 | 89.5 |
| 20.4140625 | 78.7 |
| 20.421875 | 72.5 |
| 20.4296875 | 67.9 |
| 20.4375 | 63.5 |
| 20.4453125 | 53.9 |
| 20.453125 | 43.1 |
| 20.4609375 | 36.7 |
| 20.46875 | 28.6 |
| 20.4765625 | 18.6 |
| 20.484375 | 13.6 |
| 20.4921875 | 10.4 |
| 20.5 | 4 |
| 20.5078125 | -4.5 |
| 20.515625 | -15.7 |
| 20.5234375 | -27.2 |
| 20.53125 | -35.1 |
| 20.5390625 | -41.7 |
| 20.546875 | -48.9 |
| 20.5546875 | -56.6 |
| 20.5625 | -62.8 |
| 20.5703125 | -66.8 |
| 20.578125 | -73.6 |
| 20.5859375 | -81.5 |
| 20.59375 | -86.6 |
| 20.6015625 | -96.6 |
| 20.609375 | -109.5 |
| 20.6171875 | -116.7 |
| 20.625 | -123.8 |
| 20.6328125 | -131.1 |
| 20.640625 | -133.4 |
| 20.6484375 | -138.8 |
| 20.65625 | -148.5 |
| 20.6640625 | -155.2 |
| 20.671875 | -159.2 |
| 20.6796875 | -163.6 |
| 20.6875 | -169.5 |
| 20.6953125 | -170.7 |
| 20.703125 | -161.3 |
| 20.7109375 | -152.6 |
| 20.71875 | -152.3 |
| 20.7265625 | -151.6 |
| 20.734375 | -147.1 |
| 20.7421875 | -138.3 |
| 20.75 | -125.5 |
| 20.7578125 | -114.7 |
| 20.765625 | -104.4 |
| 20.7734375 | -92 |
| 20.78125 | -81.6 |
| 20.7890625 | -71.3 |
| 20.796875 | -59.8 |
| 20.8046875 | -49.9 |
| 20.8125 | -41.5 |
| 20.8203125 | -39 |
| 20.828125 | -43.6 |
| 20.8359375 | -47.1 |
| 20.84375 | -45.8 |
| 20.8515625 | -40.7 |
| 20.859375 | -33.7 |
| 20.8671875 | -27.1 |
| 20.875 | -17.2 |
| 20.8828125 | -6.6 |
| 20.890625 | -1.1 |
| 20.8984375 | 5.2 |
| 20.90625 | 12.4 |
| 20.9140625 | 15.1 |
| 20.921875 | 19.7 |
| 20.9296875 | 23.6 |
| 20.9375 | 20.4 |
| 20.9453125 | 19.1 |
| 20.953125 | 18.1 |
| 20.9609375 | 12 |
| 20.96875 | 8.9 |
| 20.9765625 | 5.2 |
| 20.984375 | 2.4 |
| 20.9921875 | 11.7 |
| 21.0 | 17 |
| 21.0078125 | 9.6 |
| 21.015625 | 8.9 |
| 21.0234375 | 14.4 |
| 21.03125 | 16.9 |
| 21.0390625 | 20.9 |
| 21.046875 | 22.4 |
| 21.0546875 | 20 |
| 21.0625 | 19.9 |
| 21.0703125 | 18.9 |
| 21.078125 | 14.2 |
| 21.0859375 | 12.7 |
| 21.09375 | 19 |
| 21.1015625 | 26.4 |
| 21.109375 | 29.3 |
| 21.1171875 | 33.4 |
| 21.125 | 39.9 |
| 21.1328125 | 40 |
| 21.140625 | 36.1 |
| 21.1484375 | 35.5 |
| 21.15625 | 35.5 |
| 21.1640625 | 33.5 |
| 21.171875 | 34.4 |
| 21.1796875 | 39.7 |
| 21.1875 | 44.7 |
| 21.1953125 | 46.8 |
| 21.203125 | 46.1 |
| 21.2109375 | 41.2 |
| 21.21875 | 36.1 |
| 21.2265625 | 36.2 |
| 21.234375 | 35.5 |
| 21.2421875 | 31.6 |
| 21.25 | 30.4 |
| 21.2578125 | 30.7 |
| 21.265625 | 28.1 |
| 21.2734375 | 24.7 |
| 21.28125 | 20.8 |
| 21.2890625 | 15.3 |
| 21.296875 | 14.1 |
| 21.3046875 | 21.7 |
| 21.3125 | 31.3 |
| 21.3203125 | 34.2 |
| 21.328125 | 30.7 |
| 21.3359375 | 26.4 |
| 21.34375 | 23 |
| 21.3515625 | 19 |
| 21.359375 | 16.4 |
| 21.3671875 | 18.1 |
| 21.375 | 20.3 |
| 21.3828125 | 21 |
| 21.390625 | 21.8 |
| 21.3984375 | 19.7 |
| 21.40625 | 14.9 |
| 21.4140625 | 17.3 |
| 21.421875 | 27.6 |
| 21.4296875 | 35.4 |
| 21.4375 | 42.8 |
| 21.4453125 | 53.8 |
| 21.453125 | 57.5 |
| 21.4609375 | 54.6 |
| 21.46875 | 56.6 |
| 21.4765625 | 56.7 |
| 21.484375 | 49.7 |
| 21.4921875 | 42.7 |
| 21.5 | 33.4 |
| 21.5078125 | 23.3 |
| 21.515625 | 17.9 |
| 21.5234375 | 9.3 |
| 21.53125 | -2.4 |
| 21.5390625 | -8.9 |
| 21.546875 | -14.2 |
| 21.5546875 | -18.2 |
| 21.5625 | -19.1 |
| 21.5703125 | -22.8 |
| 21.578125 | -24.1 |
| 21.5859375 | -19.7 |
| 21.59375 | -18.7 |
| 21.6015625 | -18.1 |
| 21.609375 | -12.4 |
| 21.6171875 | -8.6 |
| 21.625 | -10.1 |
| 21.6328125 | -14.9 |
| 21.640625 | -15.6 |
| 21.6484375 | -9.2 |
| 21.65625 | -8.9 |
| 21.6640625 | -15.1 |
| 21.671875 | -16.3 |
| 21.6796875 | -21.3 |
| 21.6875 | -32.1 |
| 21.6953125 | -36.5 |
| 21.703125 | -39.1 |
| 21.7109375 | -43.4 |
| 21.71875 | -42.6 |
| 21.7265625 | -40.6 |
| 21.734375 | -40 |
| 21.7421875 | -39.7 |
| 21.75 | -41.3 |
| 21.7578125 | -39.6 |
| 21.765625 | -35.6 |
| 21.7734375 | -37.5 |
| 21.78125 | -40.3 |
| 21.7890625 | -37.9 |
| 21.796875 | -33.3 |
| 21.8046875 | -27.1 |
| 21.8125 | -20.7 |
| 21.8203125 | -17.6 |
| 21.828125 | -15.1 |
| 21.8359375 | -8.2 |
| 21.84375 | -0.6 |
| 21.8515625 | 0.4 |
| 21.859375 | 0.7 |
| 21.8671875 | 5.7 |
| 21.875 | 5.1 |
| 21.8828125 | -0.6 |
| 21.890625 | -0.1 |
| 21.8984375 | 2.8 |
| 21.90625 | 5 |
| 21.9140625 | 8.1 |
| 21.921875 | 6.1 |
| 21.9296875 | 2.8 |
| 21.9375 | 3.2 |
| 21.9453125 | 1 |
| 21.953125 | 0.9 |
| 21.9609375 | 4.2 |
| 21.96875 | 3.2 |
| 21.9765625 | 5.3 |
| 21.984375 | 9.1 |
| 21.9921875 | 5.7 |
| 22.0 | 5.8 |
| 22.0078125 | 10.3 |
| 22.015625 | 7.8 |
| 22.0234375 | 4.2 |
| 22.03125 | 4.1 |
| 22.0390625 | 2.5 |
| 22.046875 | -0.5 |
| 22.0546875 | -2.3 |
| 22.0625 | 0.9 |
| 22.0703125 | 4.2 |
| 22.078125 | -2.3 |
| 22.0859375 | -9.9 |
| 22.09375 | -7.2 |
| 22.1015625 | -2.6 |
| 22.109375 | -3.9 |
| 22.1171875 | -7.5 |
| 22.125 | -10.1 |
| 22.1328125 | -12.2 |
| 22.140625 | -17 |
| 22.1484375 | -22.2 |
| 22.15625 | -22.8 |
| 22.1640625 | -22.4 |
| 22.171875 | -24 |
| 22.1796875 | -23.9 |
| 22.1875 | -25.8 |
| 22.1953125 | -33 |
| 22.203125 | -36.1 |
| 22.2109375 | -31.5 |
| 22.21875 | -29.7 |
| 22.2265625 | -32 |
| 22.234375 | -27.9 |
| 22.2421875 | -17.5 |
| 22.25 | -8.7 |
| 22.2578125 | 0.5 |
| 22.265625 | 11.7 |
| 22.2734375 | 17.4 |
| 22.28125 | 18.7 |
| 22.2890625 | 22.3 |
| 22.296875 | 24.8 |
| 22.3046875 | 23.4 |
| 22.3125 | 21.8 |
| 22.3203125 | 22.3 |
| 22.328125 | 24.3 |
| 22.3359375 | 23.6 |
| 22.34375 | 21.7 |
| 22.3515625 | 25 |
| 22.359375 | 27.2 |
| 22.3671875 | 22.5 |
| 22.375 | 18.3 |
| 22.3828125 | 18.4 |
| 22.390625 | 21.2 |
| 22.3984375 | 24.1 |
| 22.40625 | 20.7 |
| 22.4140625 | 13.1 |
| 22.421875 | 8.3 |
| 22.4296875 | 3.8 |
| 22.4375 | 1.6 |
| 22.4453125 | 5.8 |
| 22.453125 | 9.3 |
| 22.4609375 | 7.5 |
| 22.46875 | 5.3 |
| 22.4765625 | 4.9 |
| 22.484375 | 4.7 |
| 22.4921875 | -0.5 |
| 22.5 | -9.6 |
| 22.5078125 | -11.3 |
| 22.515625 | -8.2 |
| 22.5234375 | -13 |
| 22.53125 | -17.9 |
| 22.5390625 | -12.7 |
| 22.546875 | -9.6 |
| 22.5546875 | -15.2 |
| 22.5625 | -20.7 |
| 22.5703125 | -22.7 |
| 22.578125 | -21.9 |
| 22.5859375 | -18.6 |
| 22.59375 | -16.8 |
| 22.6015625 | -16.8 |
| 22.609375 | -14.8 |
| 22.6171875 | -11.5 |
| 22.625 | -10.6 |
| 22.6328125 | -9.8 |
| 22.640625 | -4.7 |
| 22.6484375 | 0.6 |
| 22.65625 | 2.3 |
| 22.6640625 | 4.5 |
| 22.671875 | 4.7 |
| 22.6796875 | 2 |
| 22.6875 | 5.3 |
| 22.6953125 | 9.7 |
| 22.703125 | 6.4 |
| 22.7109375 | 3.7 |
| 22.71875 | 5 |
| 22.7265625 | 8.2 |
| 22.734375 | 14.4 |
| 22.7421875 | 19.4 |
| 22.75 | 22.7 |
| 22.7578125 | 30.6 |
| 22.765625 | 39.8 |
| 22.7734375 | 44.5 |
| 22.78125 | 44.5 |
| 22.7890625 | 39.4 |
| 22.796875 | 29.5 |
| 22.8046875 | 18.8 |
| 22.8125 | 12.6 |
| 22.8203125 | 5.7 |
| 22.828125 | -11.4 |
| 22.8359375 | -31.4 |
| 22.84375 | -43.6 |
| 22.8515625 | -53.1 |
| 22.859375 | -63.6 |
| 22.8671875 | -70.2 |
| 22.875 | -69 |
| 22.8828125 | -60.9 |
| 22.890625 | -52.6 |
| 22.8984375 | -46.3 |
| 22.90625 | -37 |
| 22.9140625 | -24.6 |
| 22.921875 | -11.2 |
| 22.9296875 | 2.1 |
| 22.9375 | 11.8 |
| 22.9453125 | 18.1 |
| 22.953125 | 25.5 |
| 22.9609375 | 33.2 |
| 22.96875 | 38.3 |
| 22.9765625 | 39.3 |
| 22.984375 | 39 |
| 22.9921875 | 44.1 |
| 23.0 | 50.9 |
| 23.0078125 | 45.5 |
| 23.015625 | 28.7 |
| 23.0234375 | 14.1 |
| 23.03125 | 7.2 |
| 23.0390625 | 5.7 |
| 23.046875 | 8.1 |
| 23.0546875 | 14.2 |
| 23.0625 | 24.1 |
| 23.0703125 | 33.8 |
| 23.078125 | 36.1 |
| 23.0859375 | 32 |
| 23.09375 | 26.3 |
| 23.1015625 | 18 |
| 23.109375 | 14.8 |
| 23.1171875 | 27.7 |
| 23.125 | 45.4 |
| 23.1328125 | 52.1 |
| 23.140625 | 49.6 |
| 23.1484375 | 35.1 |
| 23.15625 | 8.4 |
| 23.1640625 | -9.1 |
| 23.171875 | -8.1 |
| 23.1796875 | -5.2 |
| 23.1875 | -7.4 |
| 23.1953125 | -8.1 |
| 23.203125 | -5.1 |
| 23.2109375 | -0.8 |
| 23.21875 | -1 |
| 23.2265625 | -7.3 |
| 23.234375 | -11.4 |
| 23.2421875 | -9.9 |
| 23.25 | -7.8 |
| 23.2578125 | -4.2 |
| 23.265625 | 5 |
| 23.2734375 | 15 |
| 23.28125 | 16.2 |
| 23.2890625 | 10.7 |
| 23.296875 | 5.4 |
| 23.3046875 | -2.9 |
| 23.3125 | -11.4 |
| 23.3203125 | -11.2 |
| 23.328125 | -9 |
| 23.3359375 | -10.1 |
| 23.34375 | -4.9 |
| 23.3515625 | 4.1 |
| 23.359375 | 5.1 |
| 23.3671875 | -1 |
| 23.375 | -7.9 |
| 23.3828125 | -10.9 |
| 23.390625 | -9.3 |
| 23.3984375 | -9.6 |
| 23.40625 | -13 |
| 23.4140625 | -9.5 |
| 23.421875 | 3.8 |
| 23.4296875 | 13.3 |
| 23.4375 | 11.5 |
| 23.4453125 | 5.9 |
| 23.453125 | -1.7 |
| 23.4609375 | -14.8 |
| 23.46875 | -27 |
| 23.4765625 | -32.2 |
| 23.484375 | -32 |
| 23.4921875 | -30.7 |
| 23.5 | -30.7 |
| 23.5078125 | -28 |
| 23.515625 | -27.9 |
| 23.5234375 | -38.7 |
| 23.53125 | -50 |
| 23.5390625 | -51.8 |
| 23.546875 | -49.5 |
| 23.5546875 | -44.7 |
| 23.5625 | -37.1 |
| 23.5703125 | -28.3 |
| 23.578125 | -17.8 |
| 23.5859375 | -11.4 |
| 23.59375 | -10.9 |
| 23.6015625 | -11.2 |
| 23.609375 | -13.3 |
| 23.6171875 | -15.2 |
| 23.625 | -13.3 |
| 23.6328125 | -12.7 |
| 23.640625 | -10.6 |
| 23.6484375 | -2.5 |
| 23.65625 | 6.2 |
| 23.6640625 | 15.6 |
| 23.671875 | 25.9 |
| 23.6796875 | 29.6 |
| 23.6875 | 28.3 |
| 23.6953125 | 24.6 |
| 23.703125 | 17.2 |
| 23.7109375 | 12.4 |
| 23.71875 | 12.2 |
| 23.7265625 | 8.6 |
| 23.734375 | 1.9 |
| 23.7421875 | -1.4 |
| 23.75 | -0.9 |
| 23.7578125 | 5.1 |
| 23.765625 | 16.6 |
| 23.7734375 | 20.7 |
| 23.78125 | 12.6 |
| 23.7890625 | 10.4 |
| 23.796875 | 18.2 |
| 23.8046875 | 18.6 |
| 23.8125 | 15.4 |
| 23.8203125 | 21.2 |
| 23.828125 | 25.8 |
| 23.8359375 | 24 |
| 23.84375 | 26.3 |
| 23.8515625 | 31.3 |
| 23.859375 | 28.8 |
| 23.8671875 | 21.4 |
| 23.875 | 15.6 |
| 23.8828125 | 9.8 |
| 23.890625 | 4.8 |
| 23.8984375 | 4.3 |
| 23.90625 | 2.5 |
| 23.9140625 | -2.6 |
| 23.921875 | -1.7 |
| 23.9296875 | 1.9 |
| 23.9375 | -1.9 |
| 23.9453125 | -6 |
| 23.953125 | -1.7 |
| 23.9609375 | 8 |
| 23.96875 | 18 |
| 23.9765625 | 23.7 |
| 23.984375 | 22.9 |
| 23.9921875 | 19.5 |
| 24.0 | 17.9 |
| 24.0078125 | 19.8 |
| 24.015625 | 21.7 |
| 24.0234375 | 19.4 |
| 24.03125 | 13.6 |
| 24.0390625 | 6.2 |
| 24.046875 | 2 |
| 24.0546875 | 5.4 |
| 24.0625 | 12 |
| 24.0703125 | 16.3 |
| 24.078125 | 17.7 |
| 24.0859375 | 16.5 |
| 24.09375 | 14.3 |
| 24.1015625 | 10.4 |
| 24.109375 | 2.4 |
| 24.1171875 | -5.6 |
| 24.125 | -8.9 |
| 24.1328125 | -11.9 |
| 24.140625 | -17.1 |
| 24.1484375 | -19.9 |
| 24.15625 | -16.4 |
| 24.1640625 | -11.2 |
| 24.171875 | -12.6 |
| 24.1796875 | -14.8 |
| 24.1875 | -6.4 |
| 24.1953125 | 4.8 |
| 24.203125 | 7.9 |
| 24.2109375 | 8.3 |
| 24.21875 | 9.8 |
| 24.2265625 | 12.7 |
| 24.234375 | 20.1 |
| 24.2421875 | 26.4 |
| 24.25 | 27 |
| 24.2578125 | 27.2 |
| 24.265625 | 29.3 |
| 24.2734375 | 30.6 |
| 24.28125 | 26.1 |
| 24.2890625 | 15.6 |
| 24.296875 | 9.5 |
| 24.3046875 | 8.4 |
| 24.3125 | 3.5 |
| 24.3203125 | 0.1 |
| 24.328125 | 2.1 |
| 24.3359375 | 1.6 |
| 24.34375 | -0.9 |
| 24.3515625 | -2.4 |
| 24.359375 | -7.2 |
| 24.3671875 | -14.2 |
| 24.375 | -16.9 |
| 24.3828125 | -13.1 |
| 24.390625 | -7.9 |
| 24.3984375 | -3.1 |
| 24.40625 | 5.8 |
| 24.4140625 | 13.4 |
| 24.421875 | 12.3 |
| 24.4296875 | 8.9 |
| 24.4375 | 5.8 |
| 24.4453125 | 2.3 |
| 24.453125 | 5.2 |
| 24.4609375 | 10.9 |
| 24.46875 | 10.8 |
| 24.4765625 | 12.4 |
| 24.484375 | 20.3 |
| 24.4921875 | 24.9 |
| 24.5 | 22.1 |
| 24.5078125 | 18 |
| 24.515625 | 13.9 |
| 24.5234375 | 6 |
| 24.53125 | -4.6 |
| 24.5390625 | -13.2 |
| 24.546875 | -18.5 |
| 24.5546875 | -23.1 |
| 24.5625 | -28.5 |
| 24.5703125 | -29 |
| 24.578125 | -22.2 |
| 24.5859375 | -15.4 |
| 24.59375 | -6.8 |
| 24.6015625 | 5.6 |
| 24.609375 | 12.6 |
| 24.6171875 | 17.8 |
| 24.625 | 29.4 |
| 24.6328125 | 40.3 |
| 24.640625 | 55.3 |
| 24.6484375 | 80.4 |
| 24.65625 | 101.3 |
| 24.6640625 | 115.8 |
| 24.671875 | 130.3 |
| 24.6796875 | 140.7 |
| 24.6875 | 152.3 |
| 24.6953125 | 165 |
| 24.703125 | 166.9 |
| 24.7109375 | 167.9 |
| 24.71875 | 174.3 |
| 24.7265625 | 168.3 |
| 24.734375 | 150.6 |
| 24.7421875 | 137.6 |
| 24.75 | 128.7 |
| 24.7578125 | 113.8 |
| 24.765625 | 79.8 |
| 24.7734375 | 23.2 |
| 24.78125 | -36.3 |
| 24.7890625 | -84.8 |
| 24.796875 | -123.2 |
| 24.8046875 | -148.4 |
| 24.8125 | -162.5 |
| 24.8203125 | -165.5 |
| 24.828125 | -148 |
| 24.8359375 | -120.5 |
| 24.84375 | -94.5 |
| 24.8515625 | -61.7 |
| 24.859375 | -31.2 |
| 24.8671875 | -17.1 |
| 24.875 | -5.5 |
| 24.8828125 | 10.1 |
| 24.890625 | 17 |
| 24.8984375 | 8 |
| 24.90625 | -15.4 |
| 24.9140625 | -41.7 |
| 24.921875 | -62.7 |
| 24.9296875 | -86.3 |
| 24.9375 | -116 |
| 24.9453125 | -147.5 |
| 24.953125 | -179.4 |
| 24.9609375 | -203.9 |
| 24.96875 | -207.2 |
| 24.9765625 | -189.6 |
| 24.984375 | -165.3 |
| 24.9921875 | -141.6 |
| 25.0 | -115.8 |
| 25.0078125 | -90.3 |
| 25.015625 | -72.2 |
| 25.0234375 | -61.1 |
| 25.03125 | -56.6 |
| 25.0390625 | -60.2 |
| 25.046875 | -62.1 |
| 25.0546875 | -57.1 |
| 25.0625 | -57.1 |
| 25.0703125 | -65.7 |
| 25.078125 | -73.4 |
| 25.0859375 | -78.9 |
| 25.09375 | -84.3 |
| 25.1015625 | -88.3 |
| 25.109375 | -89.7 |
| 25.1171875 | -88.6 |
| 25.125 | -87.9 |
| 25.1328125 | -89.8 |
| 25.140625 | -92.8 |
| 25.1484375 | -99.4 |
| 25.15625 | -106.3 |
| 25.1640625 | -104.4 |
| 25.171875 | -102.5 |
| 25.1796875 | -112 |
| 25.1875 | -123.2 |
| 25.1953125 | -125.5 |
| 25.203125 | -121.4 |
| 25.2109375 | -113.6 |
| 25.21875 | -102.8 |
| 25.2265625 | -92.1 |
| 25.234375 | -85 |
| 25.2421875 | -79.6 |
| 25.25 | -75.1 |
| 25.2578125 | -73.1 |
| 25.265625 | -69.4 |
| 25.2734375 | -62.1 |
| 25.28125 | -57.2 |
| 25.2890625 | -53.2 |
| 25.296875 | -48.7 |
| 25.3046875 | -46.8 |
| 25.3125 | -43.3 |
| 25.3203125 | -40.6 |
| 25.328125 | -43.1 |
| 25.3359375 | -39.4 |
| 25.34375 | -28.3 |
| 25.3515625 | -20.8 |
| 25.359375 | -13.8 |
| 25.3671875 | -4.9 |
| 25.375 | 2.5 |
| 25.3828125 | 10.1 |
| 25.390625 | 14.1 |
| 25.3984375 | 17 |
| 25.40625 | 27.9 |
| 25.4140625 | 40.6 |
| 25.421875 | 51.9 |
| 25.4296875 | 65 |
| 25.4375 | 72.4 |
| 25.4453125 | 75.3 |
| 25.453125 | 78.9 |
| 25.4609375 | 79.6 |
| 25.46875 | 83.5 |
| 25.4765625 | 93.4 |
| 25.484375 | 99.2 |
| 25.4921875 | 104.6 |
| 25.5 | 112.1 |
| 25.5078125 | 113.9 |
| 25.515625 | 114.9 |
| 25.5234375 | 118.8 |
| 25.53125 | 118.4 |
| 25.5390625 | 116.7 |
| 25.546875 | 117.8 |
| 25.5546875 | 121.9 |
| 25.5625 | 132.7 |
| 25.5703125 | 144.1 |
| 25.578125 | 147.2 |
| 25.5859375 | 145.2 |
| 25.59375 | 140.4 |
| 25.6015625 | 132.9 |
| 25.609375 | 125 |
| 25.6171875 | 119.7 |
| 25.625 | 120.4 |
| 25.6328125 | 121.3 |
| 25.640625 | 120.8 |
| 25.6484375 | 128.8 |
| 25.65625 | 135.2 |
| 25.6640625 | 129.6 |
| 25.671875 | 127.9 |
| 25.6796875 | 128.5 |
| 25.6875 | 120.9 |
| 25.6953125 | 119.2 |
| 25.703125 | 122 |
| 25.7109375 | 114.3 |
| 25.71875 | 105.4 |
| 25.7265625 | 100.8 |
| 25.734375 | 92.9 |
| 25.7421875 | 85.4 |
| 25.75 | 83.8 |
| 25.7578125 | 85.4 |
| 25.765625 | 86.7 |
| 25.7734375 | 84.9 |
| 25.78125 | 80.7 |
| 25.7890625 | 76.9 |
| 25.796875 | 71.8 |
| 25.8046875 | 63.7 |
| 25.8125 | 57.7 |
| 25.8203125 | 51.9 |
| 25.828125 | 35.5 |
| 25.8359375 | 13.3 |
| 25.84375 | -0.2 |
| 25.8515625 | -9.5 |
| 25.859375 | -20.6 |
| 25.8671875 | -26 |
| 25.875 | -30.4 |
| 25.8828125 | -41.4 |
| 25.890625 | -48.4 |
| 25.8984375 | -47.8 |
| 25.90625 | -47 |
| 25.9140625 | -47.6 |
| 25.921875 | -52.1 |
| 25.9296875 | -58.5 |
| 25.9375 | -56.9 |
| 25.9453125 | -49.3 |
| 25.953125 | -45.4 |
| 25.9609375 | -41.4 |
| 25.96875 | -33.8 |
| 25.9765625 | -28.3 |
| 25.984375 | -23.5 |
| 25.9921875 | -16.6 |
| 26.0 | -13.4 |
| 26.0078125 | -13.5 |
| 26.015625 | -10.4 |
| 26.0234375 | -2.9 |
| 26.03125 | 5.7 |
| 26.0390625 | 10.1 |
| 26.046875 | 9.1 |
| 26.0546875 | 4.3 |
| 26.0625 | -5.9 |
| 26.0703125 | -12.6 |
| 26.078125 | -6 |
| 26.0859375 | 1.5 |
| 26.09375 | 3.1 |
| 26.1015625 | 5.5 |
| 26.109375 | 4.7 |
| 26.1171875 | 4.2 |
| 26.125 | 10.6 |
| 26.1328125 | 11.4 |
| 26.140625 | 4.9 |
| 26.1484375 | -1.5 |
| 26.15625 | -11.9 |
| 26.1640625 | -17 |
| 26.171875 | -7.3 |
| 26.1796875 | -0.5 |
| 26.1875 | -5.6 |
| 26.1953125 | -6.2 |
| 26.203125 | 1 |
| 26.2109375 | 3.1 |
| 26.21875 | -1.8 |
| 26.2265625 | -6.6 |
| 26.234375 | -10.6 |
| 26.2421875 | -15.3 |
| 26.25 | -19.1 |
| 26.2578125 | -19.8 |
| 26.265625 | -16.5 |
| 26.2734375 | -13.2 |
| 26.28125 | -16.5 |
| 26.2890625 | -24.7 |
| 26.296875 | -32.2 |
| 26.3046875 | -39.4 |
| 26.3125 | -47.5 |
| 26.3203125 | -54.8 |
| 26.328125 | -59.9 |
| 26.3359375 | -63.3 |
| 26.34375 | -64.7 |
| 26.3515625 | -64.1 |
| 26.359375 | -63.6 |
| 26.3671875 | -64.1 |
| 26.375 | -64.3 |
| 26.3828125 | -61.9 |
| 26.390625 | -53.9 |
| 26.3984375 | -42 |
| 26.40625 | -35.3 |
| 26.4140625 | -36.3 |
| 26.421875 | -39.8 |
| 26.4296875 | -42.2 |
| 26.4375 | -38.5 |
| 26.4453125 | -30.2 |
| 26.453125 | -28.3 |
| 26.4609375 | -33.9 |
| 26.46875 | -41.1 |
| 26.4765625 | -47.9 |
| 26.484375 | -49.4 |
| 26.4921875 | -48.2 |
| 26.5 | -52.7 |
| 26.5078125 | -57.5 |
| 26.515625 | -59.1 |
| 26.5234375 | -60.4 |
| 26.53125 | -56.9 |
| 26.5390625 | -52.1 |
| 26.546875 | -51 |
| 26.5546875 | -45.4 |
| 26.5625 | -37.2 |
| 26.5703125 | -34.9 |
| 26.578125 | -34.2 |
| 26.5859375 | -34.5 |
| 26.59375 | -36 |
| 26.6015625 | -32.1 |
| 26.609375 | -27.2 |
| 26.6171875 | -25.8 |
| 26.625 | -20.5 |
| 26.6328125 | -13 |
| 26.640625 | -11.2 |
| 26.6484375 | -14.3 |
| 26.65625 | -18.8 |
| 26.6640625 | -21.4 |
| 26.671875 | -18.7 |
| 26.6796875 | -16.8 |
| 26.6875 | -19.5 |
| 26.6953125 | -17.4 |
| 26.703125 | -8 |
| 26.7109375 | 0.9 |
| 26.71875 | 9.7 |
| 26.7265625 | 17.3 |
| 26.734375 | 17.1 |
| 26.7421875 | 14.9 |
| 26.75 | 16.3 |
| 26.7578125 | 16.7 |
| 26.765625 | 15.9 |
| 26.7734375 | 11.8 |
| 26.78125 | 3.8 |
| 26.7890625 | 3.6 |
| 26.796875 | 9.8 |
| 26.8046875 | 11.1 |
| 26.8125 | 9.7 |
| 26.8203125 | 8 |
| 26.828125 | 7.8 |
| 26.8359375 | 13.8 |
| 26.84375 | 17.8 |
| 26.8515625 | 16.8 |
| 26.859375 | 19.8 |
| 26.8671875 | 20.9 |
| 26.875 | 16 |
| 26.8828125 | 14.5 |
| 26.890625 | 16.2 |
| 26.8984375 | 16.9 |
| 26.90625 | 18 |
| 26.9140625 | 17.4 |
| 26.921875 | 15.3 |
| 26.9296875 | 13.5 |
| 26.9375 | 10.1 |
| 26.9453125 | 9.5 |
| 26.953125 | 14.6 |
| 26.9609375 | 19.4 |
| 26.96875 | 22.5 |
| 26.9765625 | 27.7 |
| 26.984375 | 34.4 |
| 26.9921875 | 37.5 |
| 27.0 | 36.1 |
| 27.0078125 | 34.4 |
| 27.015625 | 31.9 |
| 27.0234375 | 25.1 |
| 27.03125 | 20.9 |
| 27.0390625 | 24.8 |
| 27.046875 | 27.4 |
| 27.0546875 | 20.2 |
| 27.0625 | 10.5 |
| 27.0703125 | 5.7 |
| 27.078125 | 1.9 |
| 27.0859375 | -0.6 |
| 27.09375 | 2.6 |
| 27.1015625 | 4.1 |
| 27.109375 | -0.4 |
| 27.1171875 | -2.2 |
| 27.125 | 0.1 |
| 27.1328125 | 0.2 |
| 27.140625 | -2.5 |
| 27.1484375 | -6 |
| 27.15625 | -9.1 |
| 27.1640625 | -12 |
| 27.171875 | -13.6 |
| 27.1796875 | -8.8 |
| 27.1875 | -2.3 |
| 27.1953125 | -3.6 |
| 27.203125 | -7 |
| 27.2109375 | -5.8 |
| 27.21875 | -5.1 |
| 27.2265625 | -4.2 |
| 27.234375 | 1.9 |
| 27.2421875 | 7.4 |
| 27.25 | 8.4 |
| 27.2578125 | 9.4 |
| 27.265625 | 10.4 |
| 27.2734375 | 12.3 |
| 27.28125 | 16.2 |
| 27.2890625 | 14.7 |
| 27.296875 | 10.7 |
| 27.3046875 | 16.6 |
| 27.3125 | 28.1 |
| 27.3203125 | 33.5 |
| 27.328125 | 34.5 |
| 27.3359375 | 37.6 |
| 27.34375 | 39.9 |
| 27.3515625 | 36.2 |
| 27.359375 | 30.4 |
| 27.3671875 | 24.4 |
| 27.375 | 14.4 |
| 27.3828125 | 2.1 |
| 27.390625 | -9.8 |
| 27.3984375 | -18.1 |
| 27.40625 | -19.7 |
| 27.4140625 | -22.6 |
| 27.421875 | -30 |
| 27.4296875 | -32.9 |
| 27.4375 | -29.5 |
| 27.4453125 | -22.7 |
| 27.453125 | -19.3 |
| 27.4609375 | -24.4 |
| 27.46875 | -26.3 |
| 27.4765625 | -22.3 |
| 27.484375 | -21.5 |
| 27.4921875 | -16.2 |
| 27.5 | -4.9 |
| 27.5078125 | 1.9 |
| 27.515625 | 6.8 |
| 27.5234375 | 11.5 |
| 27.53125 | 14.3 |
| 27.5390625 | 20 |
| 27.546875 | 27 |
| 27.5546875 | 32 |
| 27.5625 | 35.9 |
| 27.5703125 | 36.7 |
| 27.578125 | 34.8 |
| 27.5859375 | 30.1 |
| 27.59375 | 21.8 |
| 27.6015625 | 15.5 |
| 27.609375 | 11.5 |
| 27.6171875 | 5.7 |
| 27.625 | 0.5 |
| 27.6328125 | -0.8 |
| 27.640625 | 3.5 |
| 27.6484375 | 12.2 |
| 27.65625 | 17.6 |
| 27.6640625 | 17.4 |
| 27.671875 | 17.5 |
| 27.6796875 | 19.7 |
| 27.6875 | 23 |
| 27.6953125 | 26.5 |
| 27.703125 | 27.2 |
| 27.7109375 | 24.4 |
| 27.71875 | 18.6 |
| 27.7265625 | 7.5 |
| 27.734375 | -6.6 |
| 27.7421875 | -15.3 |
| 27.75 | -17.1 |
| 27.7578125 | -21.5 |
| 27.765625 | -32.6 |
| 27.7734375 | -43.8 |
| 27.78125 | -50.1 |
| 27.7890625 | -53.6 |
| 27.796875 | -55.4 |
| 27.8046875 | -55.1 |
| 27.8125 | -51.8 |
| 27.8203125 | -45.5 |
| 27.828125 | -39.2 |
| 27.8359375 | -36.1 |
| 27.84375 | -34.3 |
| 27.8515625 | -29 |
| 27.859375 | -20 |
| 27.8671875 | -13.4 |
| 27.875 | -13.7 |
| 27.8828125 | -16.7 |
| 27.890625 | -19.6 |
| 27.8984375 | -22.2 |
| 27.90625 | -22 |
| 27.9140625 | -21.6 |
| 27.921875 | -25.1 |
| 27.9296875 | -28.5 |
| 27.9375 | -30.3 |
| 27.9453125 | -33 |
| 27.953125 | -33.7 |
| 27.9609375 | -30.1 |
| 27.96875 | -26.7 |
| 27.9765625 | -25.5 |
| 27.984375 | -25 |
| 27.9921875 | -26.8 |
| 28.0 | -30 |
| 28.0078125 | -28.6 |
| 28.015625 | -24.2 |
| 28.0234375 | -19.8 |
| 28.03125 | -13 |
| 28.0390625 | -4.7 |
| 28.046875 | 5.4 |
| 28.0546875 | 16.2 |
| 28.0625 | 17.9 |
| 28.0703125 | 13.6 |
| 28.078125 | 14.3 |
| 28.0859375 | 15.4 |
| 28.09375 | 15.4 |
| 28.1015625 | 20.4 |
| 28.109375 | 26.9 |
| 28.1171875 | 28.6 |
| 28.125 | 24.1 |
| 28.1328125 | 22.2 |
| 28.140625 | 25.6 |
| 28.1484375 | 23.5 |
| 28.15625 | 21.2 |
| 28.1640625 | 26.1 |
| 28.171875 | 25.1 |
| 28.1796875 | 21.3 |
| 28.1875 | 24.9 |
| 28.1953125 | 26.9 |
| 28.203125 | 27.2 |
| 28.2109375 | 31.9 |
| 28.21875 | 35.2 |
| 28.2265625 | 38.3 |
| 28.234375 | 47.2 |
| 28.2421875 | 58.3 |
| 28.25 | 63 |
| 28.2578125 | 60.2 |
| 28.265625 | 54.9 |
| 28.2734375 | 43.1 |
| 28.28125 | 20.8 |
| 28.2890625 | -2.1 |
| 28.296875 | -18.2 |
| 28.3046875 | -28 |
| 28.3125 | -33 |
| 28.3203125 | -34.1 |
| 28.328125 | -32.4 |
| 28.3359375 | -31.8 |
| 28.34375 | -32.3 |
| 28.3515625 | -29.5 |
| 28.359375 | -27.7 |
| 28.3671875 | -28.3 |
| 28.375 | -25.8 |
| 28.3828125 | -23.2 |
| 28.390625 | -20.2 |
| 28.3984375 | -13.2 |
| 28.40625 | -9.9 |
| 28.4140625 | -12.3 |
| 28.421875 | -11 |
| 28.4296875 | -4.8 |
| 28.4375 | 0.4 |
| 28.4453125 | 3.3 |
| 28.453125 | 6.7 |
| 28.4609375 | 8.8 |
| 28.46875 | 10.3 |
| 28.4765625 | 20 |
| 28.484375 | 29.5 |
| 28.4921875 | 22.9 |
| 28.5 | 11.9 |
| 28.5078125 | 7.4 |
| 28.515625 | 1 |
| 28.5234375 | -4.8 |
| 28.53125 | -7.1 |
| 28.5390625 | -7.9 |
| 28.546875 | -2.1 |
| 28.5546875 | 4.1 |
| 28.5625 | 2.3 |
| 28.5703125 | -0.3 |
| 28.578125 | -2.7 |
| 28.5859375 | -7.2 |
| 28.59375 | -5.3 |
| 28.6015625 | 3.3 |
| 28.609375 | 12.2 |
| 28.6171875 | 19.8 |
| 28.625 | 25.3 |
| 28.6328125 | 25.4 |
| 28.640625 | 20.7 |
| 28.6484375 | 17.9 |
| 28.65625 | 16.6 |
| 28.6640625 | 8.2 |
| 28.671875 | -3.5 |
| 28.6796875 | -8.7 |
| 28.6875 | -7.5 |
| 28.6953125 | -2.5 |
| 28.703125 | 4 |
| 28.7109375 | 7.3 |
| 28.71875 | 8.7 |
| 28.7265625 | 8.7 |
| 28.734375 | 4.8 |
| 28.7421875 | 0.6 |
| 28.75 | 1.1 |
| 28.7578125 | 4.5 |
| 28.765625 | 7.6 |
| 28.7734375 | 11.1 |
| 28.78125 | 19.1 |
| 28.7890625 | 29 |
| 28.796875 | 31.5 |
| 28.8046875 | 25.1 |
| 28.8125 | 15.2 |
| 28.8203125 | 8.9 |
| 28.828125 | 10.7 |
| 28.8359375 | 12.9 |
| 28.84375 | 6.8 |
| 28.8515625 | -0.3 |
| 28.859375 | 1.1 |
| 28.8671875 | 8.5 |
| 28.875 | 14 |
| 28.8828125 | 14.1 |
| 28.890625 | 7.9 |
| 28.8984375 | -1.3 |
| 28.90625 | -3.9 |
| 28.9140625 | -0.1 |
| 28.921875 | 1.8 |
| 28.9296875 | 8.1 |
| 28.9375 | 20.3 |
| 28.9453125 | 27 |
| 28.953125 | 28.6 |
| 28.9609375 | 25.1 |
| 28.96875 | 12.4 |
| 28.9765625 | 2.9 |
| 28.984375 | 1.5 |
| 28.9921875 | -1 |
| 29.0 | -1.9 |
| 29.0078125 | 2.3 |
| 29.015625 | 5.5 |
| 29.0234375 | 7.4 |
| 29.03125 | 12.4 |
| 29.0390625 | 18.6 |
| 29.046875 | 18.3 |
| 29.0546875 | 10.7 |
| 29.0625 | 3.5 |
| 29.0703125 | -0.5 |
| 29.078125 | -0.3 |
| 29.0859375 | 3.3 |
| 29.09375 | 4 |
| 29.1015625 | 5.5 |
| 29.109375 | 12.9 |
| 29.1171875 | 13.6 |
| 29.125 | 4.2 |
| 29.1328125 | -2.3 |
| 29.140625 | -8.5 |
| 29.1484375 | -19.7 |
| 29.15625 | -24.9 |
| 29.1640625 | -20.9 |
| 29.171875 | -13.5 |
| 29.1796875 | -0.6 |
| 29.1875 | 12.9 |
| 29.1953125 | 17 |
| 29.203125 | 13.6 |
| 29.2109375 | 6.4 |
| 29.21875 | -2.7 |
| 29.2265625 | -11.1 |
| 29.234375 | -18.3 |
| 29.2421875 | -21.8 |
| 29.25 | -20.3 |
| 29.2578125 | -14.9 |
| 29.265625 | -4.6 |
| 29.2734375 | 2.9 |
| 29.28125 | -0.2 |
| 29.2890625 | -7.4 |
| 29.296875 | -13.6 |
| 29.3046875 | -20.8 |
| 29.3125 | -25.9 |
| 29.3203125 | -24.4 |
| 29.328125 | -18.1 |
| 29.3359375 | -11.4 |
| 29.34375 | -2.9 |
| 29.3515625 | 8.2 |
| 29.359375 | 12.6 |
| 29.3671875 | 5.2 |
| 29.375 | -7.6 |
| 29.3828125 | -18.1 |
| 29.390625 | -20.4 |
| 29.3984375 | -15.6 |
| 29.40625 | -5.5 |
| 29.4140625 | 12.3 |
| 29.421875 | 28.5 |
| 29.4296875 | 34.5 |
| 29.4375 | 37.4 |
| 29.4453125 | 35.1 |
| 29.453125 | 21 |
| 29.4609375 | 7.2 |
| 29.46875 | 1.6 |
| 29.4765625 | -1.5 |
| 29.484375 | -1.7 |
| 29.4921875 | 4.7 |
| 29.5 | 16 |
| 29.5078125 | 29.1 |
| 29.515625 | 37.6 |
| 29.5234375 | 35.8 |
| 29.53125 | 27.6 |
| 29.5390625 | 20.2 |
| 29.546875 | 13.9 |
| 29.5546875 | 9 |
| 29.5625 | 10.8 |
| 29.5703125 | 18.4 |
| 29.578125 | 25.5 |
| 29.5859375 | 32.1 |
| 29.59375 | 41.2 |
| 29.6015625 | 48.5 |
| 29.609375 | 43.9 |
| 29.6171875 | 28.2 |
| 29.625 | 18.6 |
| 29.6328125 | 19.9 |
| 29.640625 | 19.8 |
| 29.6484375 | 21.2 |
| 29.65625 | 33.8 |
| 29.6640625 | 44.3 |
| 29.671875 | 41.5 |
| 29.6796875 | 39 |
| 29.6875 | 41.4 |
| 29.6953125 | 36.3 |
| 29.703125 | 26.1 |
| 29.7109375 | 20.3 |
| 29.71875 | 14.6 |
| 29.7265625 | 6.4 |
| 29.734375 | -0.4 |
| 29.7421875 | -8 |
| 29.75 | -16.5 |
| 29.7578125 | -20.3 |
| 29.765625 | -21.7 |
| 29.7734375 | -27.4 |
| 29.78125 | -38.9 |
| 29.7890625 | -52.9 |
| 29.796875 | -64.7 |
| 29.8046875 | -73.4 |
| 29.8125 | -81.5 |
| 29.8203125 | -86.2 |
| 29.828125 | -87.4 |
| 29.8359375 | -92.2 |
| 29.84375 | -100.4 |
| 29.8515625 | -107.5 |
| 29.859375 | -115.2 |
| 29.8671875 | -120.2 |
| 29.875 | -120.1 |
| 29.8828125 | -122 |
| 29.890625 | -123 |
| 29.8984375 | -116.5 |
| 29.90625 | -110.1 |
| 29.9140625 | -104.1 |
| 29.921875 | -92.7 |
| 29.9296875 | -83.4 |
| 29.9375 | -78.2 |
| 29.9453125 | -70 |
| 29.953125 | -61.7 |
| 29.9609375 | -56.8 |
| 29.96875 | -50.5 |
| 29.9765625 | -40.9 |
| 29.984375 | -31.7 |
| 29.9921875 | -23.3 |
| 30.0 | -13.6 |
| 30.0078125 | -4.6 |
| 30.015625 | 1.7 |
| 30.0234375 | 8.7 |
| 30.03125 | 16 |
| 30.0390625 | 20 |
| 30.046875 | 19.9 |
| 30.0546875 | 13.2 |
| 30.0625 | 4.1 |
| 30.0703125 | 2.2 |
| 30.078125 | 3.3 |
| 30.0859375 | 3.5 |
| 30.09375 | 9.4 |
| 30.1015625 | 15.4 |
| 30.109375 | 13.6 |
| 30.1171875 | 13.9 |
| 30.125 | 18.1 |
| 30.1328125 | 17.3 |
| 30.140625 | 17.8 |
| 30.1484375 | 23.8 |
| 30.15625 | 24.4 |
| 30.1640625 | 20.4 |
| 30.171875 | 22 |
| 30.1796875 | 25.6 |
| 30.1875 | 26.6 |
| 30.1953125 | 31.8 |
| 30.203125 | 38.2 |
| 30.2109375 | 36.4 |
| 30.21875 | 31 |
| 30.2265625 | 31 |
| 30.234375 | 37.4 |
| 30.2421875 | 45.3 |
| 30.25 | 46.8 |
| 30.2578125 | 42.9 |
| 30.265625 | 44 |
| 30.2734375 | 51 |
| 30.28125 | 59.3 |
| 30.2890625 | 68.2 |
| 30.296875 | 72.5 |
| 30.3046875 | 68.4 |
| 30.3125 | 62.3 |
| 30.3203125 | 57.6 |
| 30.328125 | 51.6 |
| 30.3359375 | 44.3 |
| 30.34375 | 37.1 |
| 30.3515625 | 28.5 |
| 30.359375 | 20.6 |
| 30.3671875 | 16.5 |
| 30.375 | 11.8 |
| 30.3828125 | 4.9 |
| 30.390625 | 2.9 |
| 30.3984375 | 5.3 |
| 30.40625 | 4.5 |
| 30.4140625 | 4.2 |
| 30.421875 | 10.8 |
| 30.4296875 | 18.6 |
| 30.4375 | 20.6 |
| 30.4453125 | 19.1 |
| 30.453125 | 19.9 |
| 30.4609375 | 20.7 |
| 30.46875 | 16.2 |
| 30.4765625 | 10.7 |
| 30.484375 | 9.7 |
| 30.4921875 | 10.3 |
| 30.5 | 11.5 |
| 30.5078125 | 15.3 |
| 30.515625 | 19 |
| 30.5234375 | 18.2 |
| 30.53125 | 10.7 |
| 30.5390625 | 0.4 |
| 30.546875 | -2.8 |
| 30.5546875 | -2.2 |
| 30.5625 | -8.9 |
| 30.5703125 | -15.6 |
| 30.578125 | -14.6 |
| 30.5859375 | -16.4 |
| 30.59375 | -18.6 |
| 30.6015625 | -10.1 |
| 30.609375 | -1.6 |
| 30.6171875 | -1.5 |
| 30.625 | -3.9 |
| 30.6328125 | -7.3 |
| 30.640625 | -9.4 |
| 30.6484375 | -9.3 |
| 30.65625 | -10.5 |
| 30.6640625 | -9.1 |
| 30.671875 | -4.9 |
| 30.6796875 | -2.8 |
| 30.6875 | -1.8 |
| 30.6953125 | -0.3 |
| 30.703125 | 1.6 |
| 30.7109375 | 2.2 |
| 30.71875 | 1.3 |
| 30.7265625 | 3.2 |
| 30.734375 | 1.6 |
| 30.7421875 | -4.2 |
| 30.75 | -0.4 |
| 30.7578125 | 4.1 |
| 30.765625 | -3.1 |
| 30.7734375 | -10.3 |
| 30.78125 | -16.2 |
| 30.7890625 | -25.1 |
| 30.796875 | -30.4 |
| 30.8046875 | -35.9 |
| 30.8125 | -43.7 |
| 30.8203125 | -45.3 |
| 30.828125 | -44.4 |
| 30.8359375 | -47.2 |
| 30.84375 | -45.7 |
| 30.8515625 | -38 |
| 30.859375 | -36 |
| 30.8671875 | -41 |
| 30.875 | -41.7 |
| 30.8828125 | -40.7 |
| 30.890625 | -45.5 |
| 30.8984375 | -47.6 |
| 30.90625 | -45.4 |
| 30.9140625 | -46.1 |
| 30.921875 | -45.4 |
| 30.9296875 | -41.8 |
| 30.9375 | -37.7 |
| 30.9453125 | -29.7 |
| 30.953125 | -19.9 |
| 30.9609375 | -9.9 |
| 30.96875 | 1.4 |
| 30.9765625 | 6.6 |
| 30.984375 | 9.6 |
| 30.9921875 | 16.7 |
| 31.0 | 16.5 |
| 31.0078125 | 9.3 |
| 31.015625 | 3 |
| 31.0234375 | -4.3 |
| 31.03125 | -6.9 |
| 31.0390625 | -6.8 |
| 31.046875 | -11.4 |
| 31.0546875 | -11.9 |
| 31.0625 | -10.3 |
| 31.0703125 | -13.9 |
| 31.078125 | -12 |
| 31.0859375 | -6 |
| 31.09375 | -2.9 |
| 31.1015625 | 4 |
| 31.109375 | 10.9 |
| 31.1171875 | 15.2 |
| 31.125 | 24.2 |
| 31.1328125 | 32.4 |
| 31.140625 | 34.9 |
| 31.1484375 | 36.5 |
| 31.15625 | 38 |
| 31.1640625 | 38.7 |
| 31.171875 | 38 |
| 31.1796875 | 35.8 |
| 31.1875 | 35.8 |
| 31.1953125 | 35.6 |
| 31.203125 | 32.2 |
| 31.2109375 | 29.1 |
| 31.21875 | 26.7 |
| 31.2265625 | 24.3 |
| 31.234375 | 22.8 |
| 31.2421875 | 17.4 |
| 31.25 | 5.8 |
| 31.2578125 | -2.9 |
| 31.265625 | -1.5 |
| 31.2734375 | 2.7 |
| 31.28125 | -0.3 |
| 31.2890625 | -5 |
| 31.296875 | -4.9 |
| 31.3046875 | -7.6 |
| 31.3125 | -15.9 |
| 31.3203125 | -21.8 |
| 31.328125 | -24.1 |
| 31.3359375 | -23.9 |
| 31.34375 | -19.2 |
| 31.3515625 | -13.4 |
| 31.359375 | -8.3 |
| 31.3671875 | -0.7 |
| 31.375 | 4.6 |
| 31.3828125 | 4.4 |
| 31.390625 | 7.1 |
| 31.3984375 | 16.6 |
| 31.40625 | 27.3 |
| 31.4140625 | 34.4 |
| 31.421875 | 38.3 |
| 31.4296875 | 44.9 |
| 31.4375 | 52.5 |
| 31.4453125 | 55.6 |
| 31.453125 | 58.8 |
| 31.4609375 | 63.2 |
| 31.46875 | 63.8 |
| 31.4765625 | 64.9 |
| 31.484375 | 67.5 |
| 31.4921875 | 67.6 |
| 31.5 | 68.1 |
| 31.5078125 | 71.2 |
| 31.515625 | 73.6 |
| 31.5234375 | 70.7 |
| 31.53125 | 63.3 |
| 31.5390625 | 55.9 |
| 31.546875 | 46.4 |
| 31.5546875 | 37.6 |
| 31.5625 | 35.8 |
| 31.5703125 | 34.6 |
| 31.578125 | 32.1 |
| 31.5859375 | 32.6 |
| 31.59375 | 30.1 |
| 31.6015625 | 24.7 |
| 31.609375 | 22.2 |
| 31.6171875 | 20.8 |
| 31.625 | 20.6 |
| 31.6328125 | 20.2 |
| 31.640625 | 15.9 |
| 31.6484375 | 8.7 |
| 31.65625 | -1.5 |
| 31.6640625 | -10.8 |
| 31.671875 | -16 |
| 31.6796875 | -24.6 |
| 31.6875 | -34.1 |
| 31.6953125 | -36.7 |
| 31.703125 | -38.2 |
| 31.7109375 | -39.8 |
| 31.71875 | -36.2 |
| 31.7265625 | -29.1 |
| 31.734375 | -20.9 |
| 31.7421875 | -17.3 |
| 31.75 | -21.4 |
| 31.7578125 | -22.4 |
| 31.765625 | -20.2 |
| 31.7734375 | -24.2 |
| 31.78125 | -27 |
| 31.7890625 | -23.4 |
| 31.796875 | -23.1 |
| 31.8046875 | -24.9 |
| 31.8125 | -23.1 |
| 31.8203125 | -21.3 |
| 31.828125 | -18 |
| 31.8359375 | -11.9 |
| 31.84375 | -10.4 |
| 31.8515625 | -8.8 |
| 31.859375 | 2.7 |
| 31.8671875 | 14.6 |
| 31.875 | 13.9 |
| 31.8828125 | 3.8 |
| 31.890625 | -5.1 |
| 31.8984375 | -9.3 |
| 31.90625 | -14.5 |
| 31.9140625 | -23.1 |
| 31.921875 | -28.5 |
| 31.9296875 | -30.4 |
| 31.9375 | -35.1 |
| 31.9453125 | -42.5 |
| 31.953125 | -48.5 |
| 31.9609375 | -53.2 |
| 31.96875 | -57.8 |
| 31.9765625 | -56.4 |
| 31.984375 | -47.1 |
| 31.9921875 | -36.2 |